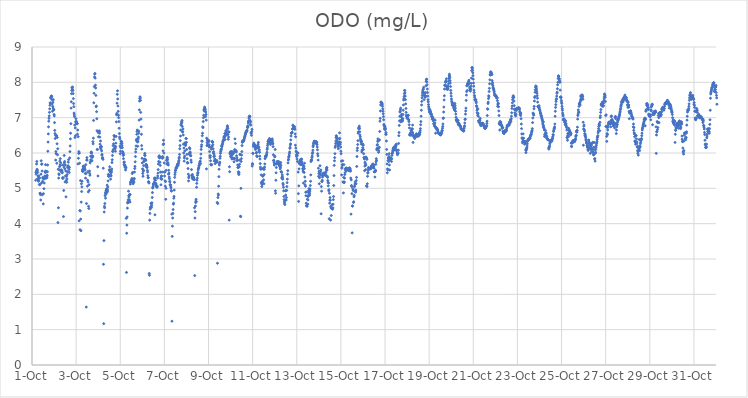
| Category | ODO (mg/L) |
|---|---|
| 44470.166666666664 | 5.23 |
| 44470.177083333336 | 5.45 |
| 44470.1875 | 5.4 |
| 44470.197916666664 | 5.49 |
| 44470.208333333336 | 5.69 |
| 44470.21875 | 5.76 |
| 44470.229166666664 | 5.54 |
| 44470.239583333336 | 5.51 |
| 44470.25 | 5.27 |
| 44470.260416666664 | 5.45 |
| 44470.270833333336 | 5.35 |
| 44470.28125 | 5.23 |
| 44470.291666666664 | 5.2 |
| 44470.302083333336 | 5.22 |
| 44470.3125 | 5.35 |
| 44470.322916666664 | 5.29 |
| 44470.333333333336 | 5.11 |
| 44470.34375 | 5.29 |
| 44470.354166666664 | 5.1 |
| 44470.364583333336 | 4.86 |
| 44470.375 | 4.86 |
| 44470.385416666664 | 4.82 |
| 44470.395833333336 | 4.67 |
| 44470.40625 | 5.4 |
| 44470.416666666664 | 5.78 |
| 44470.427083333336 | 5.15 |
| 44470.4375 | 5.68 |
| 44470.447916666664 | 5.69 |
| 44470.458333333336 | 5.49 |
| 44470.46875 | 4.82 |
| 44470.479166666664 | 5.2 |
| 44470.489583333336 | 5.31 |
| 44470.5 | 5.28 |
| 44470.510416666664 | 4.56 |
| 44470.520833333336 | 4.85 |
| 44470.53125 | 5.29 |
| 44470.541666666664 | 4.99 |
| 44470.552083333336 | 5.15 |
| 44470.5625 | 5.29 |
| 44470.572916666664 | 5.27 |
| 44470.583333333336 | 5.35 |
| 44470.59375 | 5.47 |
| 44470.604166666664 | 5.45 |
| 44470.614583333336 | 5.67 |
| 44470.625 | 5.49 |
| 44470.635416666664 | 5.46 |
| 44470.645833333336 | 5.33 |
| 44470.65625 | 5.29 |
| 44470.666666666664 | 5.34 |
| 44470.677083333336 | 5.31 |
| 44470.6875 | 5.37 |
| 44470.697916666664 | 5.47 |
| 44470.708333333336 | 5.66 |
| 44470.71875 | 6.05 |
| 44470.729166666664 | 6.31 |
| 44470.739583333336 | 6.54 |
| 44470.75 | 6.74 |
| 44470.760416666664 | 6.9 |
| 44470.770833333336 | 6.98 |
| 44470.78125 | 7.05 |
| 44470.791666666664 | 7.15 |
| 44470.802083333336 | 7.25 |
| 44470.8125 | 7.35 |
| 44470.822916666664 | 7.42 |
| 44470.833333333336 | 7.41 |
| 44470.84375 | 7.56 |
| 44470.854166666664 | 7.56 |
| 44470.864583333336 | 7.59 |
| 44470.875 | 7.61 |
| 44470.885416666664 | 7.61 |
| 44470.895833333336 | 7.59 |
| 44470.90625 | 7.51 |
| 44470.916666666664 | 7.39 |
| 44470.927083333336 | 7.18 |
| 44470.9375 | 7.32 |
| 44470.947916666664 | 7.44 |
| 44470.958333333336 | 7.27 |
| 44470.96875 | 7.51 |
| 44470.979166666664 | 7.23 |
| 44470.989583333336 | 7.22 |
| 44471.0 | 7.09 |
| 44471.010416666664 | 7.05 |
| 44471.020833333336 | 6.86 |
| 44471.03125 | 6.64 |
| 44471.041666666664 | 6.55 |
| 44471.052083333336 | 6.41 |
| 44471.0625 | 6.5 |
| 44471.072916666664 | 5.8 |
| 44471.083333333336 | 6.04 |
| 44471.09375 | 5.98 |
| 44471.104166666664 | 6.49 |
| 44471.114583333336 | 6.49 |
| 44471.125 | 5.71 |
| 44471.135416666664 | 6.26 |
| 44471.145833333336 | 6.44 |
| 44471.15625 | 5.95 |
| 44471.166666666664 | 6.12 |
| 44471.177083333336 | 4.03 |
| 44471.1875 | 5.54 |
| 44471.197916666664 | 4.45 |
| 44471.208333333336 | 5.29 |
| 44471.21875 | 5.41 |
| 44471.229166666664 | 5.39 |
| 44471.239583333336 | 5.52 |
| 44471.25 | 5.61 |
| 44471.260416666664 | 5.77 |
| 44471.270833333336 | 5.66 |
| 44471.28125 | 5.84 |
| 44471.291666666664 | 5.65 |
| 44471.302083333336 | 5.72 |
| 44471.3125 | 5.52 |
| 44471.322916666664 | 5.48 |
| 44471.333333333336 | 5.52 |
| 44471.34375 | 5.47 |
| 44471.354166666664 | 5.5 |
| 44471.364583333336 | 5.46 |
| 44471.375 | 5.44 |
| 44471.385416666664 | 5.3 |
| 44471.395833333336 | 5.28 |
| 44471.40625 | 5.66 |
| 44471.416666666664 | 5.3 |
| 44471.427083333336 | 4.2 |
| 44471.4375 | 4.94 |
| 44471.447916666664 | 5.6 |
| 44471.458333333336 | 5.93 |
| 44471.46875 | 5.72 |
| 44471.479166666664 | 5.76 |
| 44471.489583333336 | 5.55 |
| 44471.5 | 5.18 |
| 44471.510416666664 | 5.66 |
| 44471.520833333336 | 5.35 |
| 44471.53125 | 5.49 |
| 44471.541666666664 | 4.76 |
| 44471.552083333336 | 5.22 |
| 44471.5625 | 5.34 |
| 44471.572916666664 | 5.17 |
| 44471.583333333336 | 5.27 |
| 44471.59375 | 5.39 |
| 44471.604166666664 | 5.47 |
| 44471.614583333336 | 5.59 |
| 44471.625 | 5.62 |
| 44471.635416666664 | 5.64 |
| 44471.645833333336 | 5.74 |
| 44471.65625 | 5.81 |
| 44471.666666666664 | 5.6 |
| 44471.677083333336 | 5.53 |
| 44471.6875 | 5.45 |
| 44471.697916666664 | 5.59 |
| 44471.708333333336 | 5.86 |
| 44471.71875 | 6.04 |
| 44471.729166666664 | 6.2 |
| 44471.739583333336 | 6.4 |
| 44471.75 | 6.56 |
| 44471.760416666664 | 6.83 |
| 44471.770833333336 | 7.27 |
| 44471.78125 | 7.45 |
| 44471.791666666664 | 7.68 |
| 44471.802083333336 | 7.77 |
| 44471.8125 | 7.85 |
| 44471.822916666664 | 7.84 |
| 44471.833333333336 | 7.87 |
| 44471.84375 | 7.79 |
| 44471.854166666664 | 7.77 |
| 44471.864583333336 | 7.68 |
| 44471.875 | 7.54 |
| 44471.885416666664 | 7.4 |
| 44471.895833333336 | 7.31 |
| 44471.90625 | 7.13 |
| 44471.916666666664 | 7.08 |
| 44471.927083333336 | 7.03 |
| 44471.9375 | 6.79 |
| 44471.947916666664 | 6.44 |
| 44471.958333333336 | 6.71 |
| 44471.96875 | 6.49 |
| 44471.979166666664 | 6.89 |
| 44471.989583333336 | 6.97 |
| 44472.0 | 6.85 |
| 44472.010416666664 | 6.86 |
| 44472.020833333336 | 6.89 |
| 44472.03125 | 6.84 |
| 44472.041666666664 | 6.83 |
| 44472.052083333336 | 6.83 |
| 44472.0625 | 6.53 |
| 44472.072916666664 | 6.65 |
| 44472.083333333336 | 5.69 |
| 44472.09375 | 6.46 |
| 44472.104166666664 | 5.85 |
| 44472.114583333336 | 5.99 |
| 44472.125 | 6.04 |
| 44472.135416666664 | 4.08 |
| 44472.145833333336 | 6 |
| 44472.15625 | 5.71 |
| 44472.166666666664 | 4.37 |
| 44472.177083333336 | 3.83 |
| 44472.1875 | 4.36 |
| 44472.197916666664 | 5.22 |
| 44472.208333333336 | 4.13 |
| 44472.21875 | 3.8 |
| 44472.229166666664 | 4.61 |
| 44472.239583333336 | 5.13 |
| 44472.25 | 4.91 |
| 44472.260416666664 | 5.04 |
| 44472.270833333336 | 5.2 |
| 44472.28125 | 5.52 |
| 44472.291666666664 | 5.48 |
| 44472.302083333336 | 5.48 |
| 44472.3125 | 5.55 |
| 44472.322916666664 | 5.62 |
| 44472.333333333336 | 5.63 |
| 44472.34375 | 5.57 |
| 44472.354166666664 | 5.59 |
| 44472.364583333336 | 5.59 |
| 44472.375 | 5.61 |
| 44472.385416666664 | 5.56 |
| 44472.395833333336 | 5.52 |
| 44472.40625 | 5.52 |
| 44472.416666666664 | 5.42 |
| 44472.427083333336 | 5.29 |
| 44472.4375 | 5.67 |
| 44472.447916666664 | 5.42 |
| 44472.458333333336 | 1.64 |
| 44472.46875 | 4.57 |
| 44472.479166666664 | 5.8 |
| 44472.489583333336 | 5.87 |
| 44472.5 | 5.8 |
| 44472.510416666664 | 5.06 |
| 44472.520833333336 | 5.23 |
| 44472.53125 | 5.47 |
| 44472.541666666664 | 5.18 |
| 44472.552083333336 | 4.9 |
| 44472.5625 | 4.49 |
| 44472.572916666664 | 4.43 |
| 44472.583333333336 | 5.1 |
| 44472.59375 | 4.94 |
| 44472.604166666664 | 5.49 |
| 44472.614583333336 | 5.42 |
| 44472.625 | 5.37 |
| 44472.635416666664 | 5.72 |
| 44472.645833333336 | 5.76 |
| 44472.65625 | 5.91 |
| 44472.666666666664 | 5.81 |
| 44472.677083333336 | 6.01 |
| 44472.6875 | 6.03 |
| 44472.697916666664 | 6 |
| 44472.708333333336 | 5.91 |
| 44472.71875 | 5.78 |
| 44472.729166666664 | 5.87 |
| 44472.739583333336 | 5.92 |
| 44472.75 | 5.9 |
| 44472.760416666664 | 6.32 |
| 44472.770833333336 | 6.26 |
| 44472.78125 | 6.42 |
| 44472.791666666664 | 6.92 |
| 44472.802083333336 | 7.42 |
| 44472.8125 | 7.69 |
| 44472.822916666664 | 7.88 |
| 44472.833333333336 | 8.15 |
| 44472.84375 | 8.23 |
| 44472.854166666664 | 8.25 |
| 44472.864583333336 | 8.12 |
| 44472.875 | 7.92 |
| 44472.885416666664 | 7.84 |
| 44472.895833333336 | 7.63 |
| 44472.90625 | 7.31 |
| 44472.916666666664 | 7.33 |
| 44472.927083333336 | 7.17 |
| 44472.9375 | 6.97 |
| 44472.947916666664 | 6.63 |
| 44472.958333333336 | 6.1 |
| 44472.96875 | 6.1 |
| 44472.979166666664 | 5.61 |
| 44472.989583333336 | 5.35 |
| 44473.0 | 6.58 |
| 44473.010416666664 | 6.46 |
| 44473.020833333336 | 6.61 |
| 44473.03125 | 6.6 |
| 44473.041666666664 | 6.62 |
| 44473.052083333336 | 6.62 |
| 44473.0625 | 6.56 |
| 44473.072916666664 | 6.45 |
| 44473.083333333336 | 6.25 |
| 44473.09375 | 6.17 |
| 44473.104166666664 | 6.34 |
| 44473.114583333336 | 6.14 |
| 44473.125 | 6.11 |
| 44473.135416666664 | 6.19 |
| 44473.145833333336 | 6.17 |
| 44473.15625 | 6.06 |
| 44473.166666666664 | 5.94 |
| 44473.177083333336 | 5.96 |
| 44473.1875 | 5.85 |
| 44473.197916666664 | 5.87 |
| 44473.208333333336 | 5.86 |
| 44473.21875 | 5.82 |
| 44473.229166666664 | 5.57 |
| 44473.239583333336 | 2.85 |
| 44473.25 | 1.17 |
| 44473.260416666664 | 3.52 |
| 44473.270833333336 | 4.33 |
| 44473.28125 | 4.49 |
| 44473.291666666664 | 4.45 |
| 44473.302083333336 | 4.57 |
| 44473.3125 | 4.79 |
| 44473.322916666664 | 4.87 |
| 44473.333333333336 | 4.72 |
| 44473.34375 | 4.83 |
| 44473.354166666664 | 4.92 |
| 44473.364583333336 | 4.94 |
| 44473.375 | 4.97 |
| 44473.385416666664 | 4.99 |
| 44473.395833333336 | 4.88 |
| 44473.40625 | 5.09 |
| 44473.416666666664 | 4.97 |
| 44473.427083333336 | 4.92 |
| 44473.4375 | 5.04 |
| 44473.447916666664 | 5.21 |
| 44473.458333333336 | 5.39 |
| 44473.46875 | 5.34 |
| 44473.479166666664 | 5.38 |
| 44473.489583333336 | 5.34 |
| 44473.5 | 5.52 |
| 44473.510416666664 | 5.52 |
| 44473.520833333336 | 5.61 |
| 44473.53125 | 5.52 |
| 44473.541666666664 | 5.47 |
| 44473.552083333336 | 5.45 |
| 44473.5625 | 5.26 |
| 44473.572916666664 | 5.37 |
| 44473.583333333336 | 5.35 |
| 44473.59375 | 5.44 |
| 44473.604166666664 | 5.49 |
| 44473.614583333336 | 5.55 |
| 44473.625 | 5.73 |
| 44473.635416666664 | 5.81 |
| 44473.645833333336 | 5.93 |
| 44473.65625 | 6.05 |
| 44473.666666666664 | 6.04 |
| 44473.677083333336 | 6.21 |
| 44473.6875 | 6.1 |
| 44473.697916666664 | 6.26 |
| 44473.708333333336 | 6.38 |
| 44473.71875 | 6.49 |
| 44473.729166666664 | 6.49 |
| 44473.739583333336 | 6.46 |
| 44473.75 | 6.16 |
| 44473.760416666664 | 6.19 |
| 44473.770833333336 | 6.12 |
| 44473.78125 | 6.05 |
| 44473.791666666664 | 6.18 |
| 44473.802083333336 | 6.28 |
| 44473.8125 | 6.47 |
| 44473.822916666664 | 6.88 |
| 44473.833333333336 | 7.08 |
| 44473.84375 | 7.12 |
| 44473.854166666664 | 7.41 |
| 44473.864583333336 | 7.66 |
| 44473.875 | 7.76 |
| 44473.885416666664 | 7.53 |
| 44473.895833333336 | 7.33 |
| 44473.90625 | 7.18 |
| 44473.916666666664 | 7.07 |
| 44473.927083333336 | 7 |
| 44473.9375 | 6.89 |
| 44473.947916666664 | 6.7 |
| 44473.958333333336 | 6.55 |
| 44473.96875 | 6.45 |
| 44473.979166666664 | 6.4 |
| 44473.989583333336 | 6.2 |
| 44474.0 | 5.98 |
| 44474.010416666664 | 6.05 |
| 44474.020833333336 | 6.15 |
| 44474.03125 | 6.27 |
| 44474.041666666664 | 6.33 |
| 44474.052083333336 | 6.32 |
| 44474.0625 | 6.32 |
| 44474.072916666664 | 6.27 |
| 44474.083333333336 | 6.21 |
| 44474.09375 | 6.15 |
| 44474.104166666664 | 6.04 |
| 44474.114583333336 | 5.99 |
| 44474.125 | 6.02 |
| 44474.135416666664 | 5.93 |
| 44474.145833333336 | 5.84 |
| 44474.15625 | 5.96 |
| 44474.166666666664 | 5.74 |
| 44474.177083333336 | 5.68 |
| 44474.1875 | 5.74 |
| 44474.197916666664 | 5.65 |
| 44474.208333333336 | 5.61 |
| 44474.21875 | 5.65 |
| 44474.229166666664 | 5.59 |
| 44474.239583333336 | 5.52 |
| 44474.25 | 5.6 |
| 44474.260416666664 | 5.58 |
| 44474.270833333336 | 4.15 |
| 44474.28125 | 2.62 |
| 44474.291666666664 | 3.73 |
| 44474.302083333336 | 3.96 |
| 44474.3125 | 4.19 |
| 44474.322916666664 | 4.44 |
| 44474.333333333336 | 4.59 |
| 44474.34375 | 4.59 |
| 44474.354166666664 | 4.63 |
| 44474.364583333336 | 4.68 |
| 44474.375 | 4.92 |
| 44474.385416666664 | 4.79 |
| 44474.395833333336 | 4.75 |
| 44474.40625 | 4.63 |
| 44474.416666666664 | 4.67 |
| 44474.427083333336 | 4.83 |
| 44474.4375 | 4.61 |
| 44474.447916666664 | 4.82 |
| 44474.458333333336 | 5.12 |
| 44474.46875 | 5.17 |
| 44474.479166666664 | 5.18 |
| 44474.489583333336 | 5.19 |
| 44474.5 | 5.2 |
| 44474.510416666664 | 5.24 |
| 44474.520833333336 | 5.24 |
| 44474.53125 | 5.28 |
| 44474.541666666664 | 5.42 |
| 44474.552083333336 | 5.19 |
| 44474.5625 | 5.45 |
| 44474.572916666664 | 5.22 |
| 44474.583333333336 | 5.13 |
| 44474.59375 | 5.2 |
| 44474.604166666664 | 5.19 |
| 44474.614583333336 | 5.17 |
| 44474.625 | 5.26 |
| 44474.635416666664 | 5.28 |
| 44474.645833333336 | 5.46 |
| 44474.65625 | 5.56 |
| 44474.666666666664 | 5.62 |
| 44474.677083333336 | 5.75 |
| 44474.6875 | 5.9 |
| 44474.697916666664 | 6.03 |
| 44474.708333333336 | 6.11 |
| 44474.71875 | 6.2 |
| 44474.729166666664 | 6.35 |
| 44474.739583333336 | 6.39 |
| 44474.75 | 6.53 |
| 44474.760416666664 | 6.61 |
| 44474.770833333336 | 6.65 |
| 44474.78125 | 6.31 |
| 44474.791666666664 | 6.19 |
| 44474.802083333336 | 6.33 |
| 44474.8125 | 6.4 |
| 44474.822916666664 | 6.45 |
| 44474.833333333336 | 6.56 |
| 44474.84375 | 6.62 |
| 44474.854166666664 | 6.93 |
| 44474.864583333336 | 7.22 |
| 44474.875 | 7.47 |
| 44474.885416666664 | 7.54 |
| 44474.895833333336 | 7.59 |
| 44474.90625 | 7.56 |
| 44474.916666666664 | 7.49 |
| 44474.927083333336 | 7.15 |
| 44474.9375 | 6.96 |
| 44474.947916666664 | 6.74 |
| 44474.958333333336 | 6.53 |
| 44474.96875 | 6.21 |
| 44474.979166666664 | 6.11 |
| 44474.989583333336 | 5.85 |
| 44475.0 | 5.72 |
| 44475.010416666664 | 5.55 |
| 44475.020833333336 | 5.42 |
| 44475.03125 | 5.34 |
| 44475.041666666664 | 5.48 |
| 44475.052083333336 | 5.51 |
| 44475.0625 | 5.64 |
| 44475.072916666664 | 5.76 |
| 44475.083333333336 | 5.78 |
| 44475.09375 | 5.83 |
| 44475.104166666664 | 5.94 |
| 44475.114583333336 | 5.99 |
| 44475.125 | 5.93 |
| 44475.135416666664 | 5.82 |
| 44475.145833333336 | 5.81 |
| 44475.15625 | 5.79 |
| 44475.166666666664 | 5.68 |
| 44475.177083333336 | 5.64 |
| 44475.1875 | 5.6 |
| 44475.197916666664 | 5.66 |
| 44475.208333333336 | 5.63 |
| 44475.21875 | 5.59 |
| 44475.229166666664 | 5.51 |
| 44475.239583333336 | 5.46 |
| 44475.25 | 5.36 |
| 44475.260416666664 | 5.3 |
| 44475.270833333336 | 5.3 |
| 44475.28125 | 5.19 |
| 44475.291666666664 | 5.17 |
| 44475.302083333336 | 5.15 |
| 44475.3125 | 2.59 |
| 44475.322916666664 | 2.54 |
| 44475.333333333336 | 4.1 |
| 44475.34375 | 4.29 |
| 44475.354166666664 | 4.41 |
| 44475.364583333336 | 4.45 |
| 44475.375 | 4.46 |
| 44475.385416666664 | 4.48 |
| 44475.395833333336 | 4.58 |
| 44475.40625 | 4.57 |
| 44475.416666666664 | 4.46 |
| 44475.427083333336 | 4.52 |
| 44475.4375 | 4.59 |
| 44475.447916666664 | 4.74 |
| 44475.458333333336 | 4.88 |
| 44475.46875 | 5.01 |
| 44475.479166666664 | 5.02 |
| 44475.489583333336 | 5.06 |
| 44475.5 | 5.12 |
| 44475.510416666664 | 5.11 |
| 44475.520833333336 | 5.13 |
| 44475.53125 | 5.13 |
| 44475.541666666664 | 5.17 |
| 44475.552083333336 | 5.29 |
| 44475.5625 | 5.24 |
| 44475.572916666664 | 4.25 |
| 44475.583333333336 | 5.29 |
| 44475.59375 | 5.23 |
| 44475.604166666664 | 5.12 |
| 44475.614583333336 | 5.14 |
| 44475.625 | 5.09 |
| 44475.635416666664 | 5.06 |
| 44475.645833333336 | 5.07 |
| 44475.65625 | 5.04 |
| 44475.666666666664 | 5.03 |
| 44475.677083333336 | 5.06 |
| 44475.6875 | 5.29 |
| 44475.697916666664 | 5.35 |
| 44475.708333333336 | 5.43 |
| 44475.71875 | 5.53 |
| 44475.729166666664 | 5.69 |
| 44475.739583333336 | 5.76 |
| 44475.75 | 5.9 |
| 44475.760416666664 | 5.88 |
| 44475.770833333336 | 5.92 |
| 44475.78125 | 5.86 |
| 44475.791666666664 | 5.88 |
| 44475.802083333336 | 5.74 |
| 44475.8125 | 5.65 |
| 44475.822916666664 | 5.46 |
| 44475.833333333336 | 5.29 |
| 44475.84375 | 5.1 |
| 44475.854166666664 | 5.26 |
| 44475.864583333336 | 5.35 |
| 44475.875 | 5.34 |
| 44475.885416666664 | 5.26 |
| 44475.895833333336 | 5.46 |
| 44475.90625 | 5.85 |
| 44475.916666666664 | 5.9 |
| 44475.927083333336 | 5.87 |
| 44475.9375 | 6.06 |
| 44475.947916666664 | 6.24 |
| 44475.958333333336 | 6.36 |
| 44475.96875 | 6.26 |
| 44475.979166666664 | 6 |
| 44475.989583333336 | 5.72 |
| 44476.0 | 5.46 |
| 44476.010416666664 | 5.35 |
| 44476.020833333336 | 5.46 |
| 44476.03125 | 5.21 |
| 44476.041666666664 | 5.06 |
| 44476.052083333336 | 5.19 |
| 44476.0625 | 4.69 |
| 44476.072916666664 | 5 |
| 44476.083333333336 | 5.51 |
| 44476.09375 | 5.79 |
| 44476.104166666664 | 5.69 |
| 44476.114583333336 | 5.83 |
| 44476.125 | 5.88 |
| 44476.135416666664 | 5.86 |
| 44476.145833333336 | 5.81 |
| 44476.15625 | 5.73 |
| 44476.166666666664 | 5.69 |
| 44476.177083333336 | 5.66 |
| 44476.1875 | 5.4 |
| 44476.197916666664 | 5.51 |
| 44476.208333333336 | 5.43 |
| 44476.21875 | 5.32 |
| 44476.229166666664 | 5.27 |
| 44476.239583333336 | 5.2 |
| 44476.25 | 5.18 |
| 44476.260416666664 | 5.1 |
| 44476.270833333336 | 5.1 |
| 44476.28125 | 5.09 |
| 44476.291666666664 | 5.04 |
| 44476.302083333336 | 5.01 |
| 44476.3125 | 4.94 |
| 44476.322916666664 | 4.92 |
| 44476.333333333336 | 4.27 |
| 44476.34375 | 1.24 |
| 44476.354166666664 | 3.64 |
| 44476.364583333336 | 3.93 |
| 44476.375 | 4.16 |
| 44476.385416666664 | 4.29 |
| 44476.395833333336 | 4.4 |
| 44476.40625 | 4.55 |
| 44476.416666666664 | 4.58 |
| 44476.427083333336 | 4.72 |
| 44476.4375 | 4.77 |
| 44476.447916666664 | 4.95 |
| 44476.458333333336 | 5.17 |
| 44476.46875 | 5.31 |
| 44476.479166666664 | 5.39 |
| 44476.489583333336 | 5.45 |
| 44476.5 | 5.51 |
| 44476.510416666664 | 5.51 |
| 44476.520833333336 | 5.57 |
| 44476.53125 | 5.58 |
| 44476.541666666664 | 5.57 |
| 44476.552083333336 | 5.59 |
| 44476.5625 | 5.6 |
| 44476.572916666664 | 5.64 |
| 44476.583333333336 | 5.66 |
| 44476.59375 | 5.68 |
| 44476.604166666664 | 5.68 |
| 44476.614583333336 | 5.68 |
| 44476.625 | 5.65 |
| 44476.635416666664 | 5.71 |
| 44476.645833333336 | 5.75 |
| 44476.65625 | 5.79 |
| 44476.666666666664 | 5.85 |
| 44476.677083333336 | 5.88 |
| 44476.6875 | 5.96 |
| 44476.697916666664 | 6.12 |
| 44476.708333333336 | 6.21 |
| 44476.71875 | 6.35 |
| 44476.729166666664 | 6.48 |
| 44476.739583333336 | 6.65 |
| 44476.75 | 6.8 |
| 44476.760416666664 | 6.79 |
| 44476.770833333336 | 6.84 |
| 44476.78125 | 6.89 |
| 44476.791666666664 | 6.87 |
| 44476.802083333336 | 6.92 |
| 44476.8125 | 6.75 |
| 44476.822916666664 | 6.6 |
| 44476.833333333336 | 6.6 |
| 44476.84375 | 6.68 |
| 44476.854166666664 | 6.51 |
| 44476.864583333336 | 6.25 |
| 44476.875 | 6 |
| 44476.885416666664 | 6.14 |
| 44476.895833333336 | 5.77 |
| 44476.90625 | 5.86 |
| 44476.916666666664 | 5.91 |
| 44476.927083333336 | 6.06 |
| 44476.9375 | 6.29 |
| 44476.947916666664 | 6.25 |
| 44476.958333333336 | 6.21 |
| 44476.96875 | 6.25 |
| 44476.979166666664 | 6.41 |
| 44476.989583333336 | 6.41 |
| 44477.0 | 6.3 |
| 44477.010416666664 | 6.1 |
| 44477.020833333336 | 5.96 |
| 44477.03125 | 5.84 |
| 44477.041666666664 | 5.73 |
| 44477.052083333336 | 5.72 |
| 44477.0625 | 5.72 |
| 44477.072916666664 | 5.56 |
| 44477.083333333336 | 5.4 |
| 44477.09375 | 5.21 |
| 44477.104166666664 | 5.3 |
| 44477.114583333336 | 5.34 |
| 44477.125 | 5.99 |
| 44477.135416666664 | 6.15 |
| 44477.145833333336 | 5.95 |
| 44477.15625 | 6.12 |
| 44477.166666666664 | 6.03 |
| 44477.177083333336 | 6 |
| 44477.1875 | 5.93 |
| 44477.197916666664 | 5.92 |
| 44477.208333333336 | 5.8 |
| 44477.21875 | 5.74 |
| 44477.229166666664 | 5.53 |
| 44477.239583333336 | 5.37 |
| 44477.25 | 5.37 |
| 44477.260416666664 | 5.29 |
| 44477.270833333336 | 5.39 |
| 44477.28125 | 5.33 |
| 44477.291666666664 | 5.26 |
| 44477.302083333336 | 5.31 |
| 44477.3125 | 5.31 |
| 44477.322916666664 | 5.31 |
| 44477.333333333336 | 5.26 |
| 44477.34375 | 5.26 |
| 44477.354166666664 | 5.25 |
| 44477.364583333336 | 4.45 |
| 44477.375 | 2.53 |
| 44477.385416666664 | 4.16 |
| 44477.395833333336 | 4.34 |
| 44477.40625 | 4.5 |
| 44477.416666666664 | 4.6 |
| 44477.427083333336 | 4.64 |
| 44477.4375 | 4.69 |
| 44477.447916666664 | 4.62 |
| 44477.458333333336 | 5.03 |
| 44477.46875 | 5.14 |
| 44477.479166666664 | 5.23 |
| 44477.489583333336 | 5.29 |
| 44477.5 | 5.37 |
| 44477.510416666664 | 5.42 |
| 44477.520833333336 | 5.45 |
| 44477.53125 | 5.52 |
| 44477.541666666664 | 5.56 |
| 44477.552083333336 | 5.57 |
| 44477.5625 | 5.6 |
| 44477.572916666664 | 5.64 |
| 44477.583333333336 | 5.65 |
| 44477.59375 | 5.69 |
| 44477.604166666664 | 5.72 |
| 44477.614583333336 | 5.75 |
| 44477.625 | 5.77 |
| 44477.635416666664 | 5.7 |
| 44477.645833333336 | 5.85 |
| 44477.65625 | 5.97 |
| 44477.666666666664 | 6.1 |
| 44477.677083333336 | 6.18 |
| 44477.6875 | 6.23 |
| 44477.697916666664 | 6.34 |
| 44477.708333333336 | 6.33 |
| 44477.71875 | 6.49 |
| 44477.729166666664 | 6.56 |
| 44477.739583333336 | 6.74 |
| 44477.75 | 6.72 |
| 44477.760416666664 | 6.89 |
| 44477.770833333336 | 7 |
| 44477.78125 | 7.07 |
| 44477.791666666664 | 7.22 |
| 44477.802083333336 | 7.19 |
| 44477.8125 | 7.25 |
| 44477.822916666664 | 7.3 |
| 44477.833333333336 | 7.27 |
| 44477.84375 | 7.21 |
| 44477.854166666664 | 7.24 |
| 44477.864583333336 | 7.03 |
| 44477.875 | 7.16 |
| 44477.885416666664 | 7.09 |
| 44477.895833333336 | 6.93 |
| 44477.90625 | 5.55 |
| 44477.916666666664 | 6.42 |
| 44477.927083333336 | 6.21 |
| 44477.9375 | 6.29 |
| 44477.947916666664 | 6.35 |
| 44477.958333333336 | 6.38 |
| 44477.96875 | 6.36 |
| 44477.979166666664 | 6.24 |
| 44477.989583333336 | 6.21 |
| 44478.0 | 6.2 |
| 44478.010416666664 | 6.32 |
| 44478.020833333336 | 6.35 |
| 44478.03125 | 6.23 |
| 44478.041666666664 | 6.17 |
| 44478.052083333336 | 6.04 |
| 44478.0625 | 5.92 |
| 44478.072916666664 | 5.87 |
| 44478.083333333336 | 5.92 |
| 44478.09375 | 5.78 |
| 44478.104166666664 | 5.68 |
| 44478.114583333336 | 5.66 |
| 44478.125 | 6.11 |
| 44478.135416666664 | 6.17 |
| 44478.145833333336 | 5.67 |
| 44478.15625 | 6.19 |
| 44478.166666666664 | 6.33 |
| 44478.177083333336 | 6.31 |
| 44478.1875 | 6.3 |
| 44478.197916666664 | 6.23 |
| 44478.208333333336 | 6.12 |
| 44478.21875 | 6 |
| 44478.229166666664 | 6.04 |
| 44478.239583333336 | 5.9 |
| 44478.25 | 5.97 |
| 44478.260416666664 | 5.77 |
| 44478.270833333336 | 5.91 |
| 44478.28125 | 5.83 |
| 44478.291666666664 | 5.78 |
| 44478.302083333336 | 5.7 |
| 44478.3125 | 5.81 |
| 44478.322916666664 | 5.78 |
| 44478.333333333336 | 5.78 |
| 44478.34375 | 5.76 |
| 44478.354166666664 | 5.76 |
| 44478.364583333336 | 5.75 |
| 44478.375 | 5.79 |
| 44478.385416666664 | 5.74 |
| 44478.395833333336 | 4.6 |
| 44478.40625 | 2.88 |
| 44478.416666666664 | 4.57 |
| 44478.427083333336 | 4.74 |
| 44478.4375 | 4.84 |
| 44478.447916666664 | 4.81 |
| 44478.458333333336 | 5.06 |
| 44478.46875 | 5.33 |
| 44478.479166666664 | 5.54 |
| 44478.489583333336 | 5.66 |
| 44478.5 | 5.71 |
| 44478.510416666664 | 5.74 |
| 44478.520833333336 | 5.85 |
| 44478.53125 | 5.91 |
| 44478.541666666664 | 5.99 |
| 44478.552083333336 | 6.04 |
| 44478.5625 | 6.07 |
| 44478.572916666664 | 6.1 |
| 44478.583333333336 | 6.12 |
| 44478.59375 | 6.2 |
| 44478.604166666664 | 6.18 |
| 44478.614583333336 | 6.2 |
| 44478.625 | 6.24 |
| 44478.635416666664 | 6.26 |
| 44478.645833333336 | 6.31 |
| 44478.65625 | 6.32 |
| 44478.666666666664 | 6.36 |
| 44478.677083333336 | 6.36 |
| 44478.6875 | 6.39 |
| 44478.697916666664 | 6.44 |
| 44478.708333333336 | 6.47 |
| 44478.71875 | 6.46 |
| 44478.729166666664 | 6.46 |
| 44478.739583333336 | 6.55 |
| 44478.75 | 6.38 |
| 44478.760416666664 | 6.54 |
| 44478.770833333336 | 6.54 |
| 44478.78125 | 6.63 |
| 44478.791666666664 | 6.5 |
| 44478.802083333336 | 6.6 |
| 44478.8125 | 6.57 |
| 44478.822916666664 | 6.64 |
| 44478.833333333336 | 6.54 |
| 44478.84375 | 6.7 |
| 44478.854166666664 | 6.77 |
| 44478.864583333336 | 6.74 |
| 44478.875 | 6.69 |
| 44478.885416666664 | 6.52 |
| 44478.895833333336 | 6.39 |
| 44478.90625 | 6.45 |
| 44478.916666666664 | 6.59 |
| 44478.927083333336 | 6.6 |
| 44478.9375 | 4.1 |
| 44478.947916666664 | 5.61 |
| 44478.958333333336 | 5.47 |
| 44478.96875 | 6 |
| 44478.979166666664 | 5.97 |
| 44478.989583333336 | 6.03 |
| 44479.0 | 5.9 |
| 44479.010416666664 | 6.03 |
| 44479.020833333336 | 5.95 |
| 44479.03125 | 5.89 |
| 44479.041666666664 | 6.04 |
| 44479.052083333336 | 5.86 |
| 44479.0625 | 5.83 |
| 44479.072916666664 | 5.95 |
| 44479.083333333336 | 5.96 |
| 44479.09375 | 5.99 |
| 44479.104166666664 | 5.86 |
| 44479.114583333336 | 6.04 |
| 44479.125 | 6 |
| 44479.135416666664 | 5.99 |
| 44479.145833333336 | 5.84 |
| 44479.15625 | 5.75 |
| 44479.166666666664 | 5.83 |
| 44479.177083333336 | 5.85 |
| 44479.1875 | 6.1 |
| 44479.197916666664 | 6.4 |
| 44479.208333333336 | 6.05 |
| 44479.21875 | 6.27 |
| 44479.229166666664 | 6.06 |
| 44479.239583333336 | 6.07 |
| 44479.25 | 6.05 |
| 44479.260416666664 | 6.03 |
| 44479.270833333336 | 5.92 |
| 44479.28125 | 5.79 |
| 44479.291666666664 | 5.86 |
| 44479.302083333336 | 5.8 |
| 44479.3125 | 5.79 |
| 44479.322916666664 | 5.66 |
| 44479.333333333336 | 5.59 |
| 44479.34375 | 5.59 |
| 44479.354166666664 | 5.47 |
| 44479.364583333336 | 5.42 |
| 44479.375 | 5.39 |
| 44479.385416666664 | 5.45 |
| 44479.395833333336 | 5.61 |
| 44479.40625 | 5.68 |
| 44479.416666666664 | 5.8 |
| 44479.427083333336 | 5.96 |
| 44479.4375 | 5.96 |
| 44479.447916666664 | 4.21 |
| 44479.458333333336 | 4.2 |
| 44479.46875 | 5 |
| 44479.479166666664 | 5.76 |
| 44479.489583333336 | 5.84 |
| 44479.5 | 5.94 |
| 44479.510416666664 | 6.04 |
| 44479.520833333336 | 6.21 |
| 44479.53125 | 6.3 |
| 44479.541666666664 | 6.34 |
| 44479.552083333336 | 6.34 |
| 44479.5625 | 6.32 |
| 44479.572916666664 | 6.34 |
| 44479.583333333336 | 6.33 |
| 44479.59375 | 6.34 |
| 44479.604166666664 | 6.36 |
| 44479.614583333336 | 6.39 |
| 44479.625 | 6.42 |
| 44479.635416666664 | 6.45 |
| 44479.645833333336 | 6.47 |
| 44479.65625 | 6.49 |
| 44479.666666666664 | 6.53 |
| 44479.677083333336 | 6.54 |
| 44479.6875 | 6.58 |
| 44479.697916666664 | 6.58 |
| 44479.708333333336 | 6.6 |
| 44479.71875 | 6.62 |
| 44479.729166666664 | 6.63 |
| 44479.739583333336 | 6.62 |
| 44479.75 | 6.65 |
| 44479.760416666664 | 6.73 |
| 44479.770833333336 | 6.72 |
| 44479.78125 | 6.77 |
| 44479.791666666664 | 6.74 |
| 44479.802083333336 | 6.85 |
| 44479.8125 | 6.89 |
| 44479.822916666664 | 6.91 |
| 44479.833333333336 | 6.98 |
| 44479.84375 | 7.03 |
| 44479.854166666664 | 7.04 |
| 44479.864583333336 | 7.02 |
| 44479.875 | 7.04 |
| 44479.885416666664 | 6.92 |
| 44479.895833333336 | 6.81 |
| 44479.90625 | 6.88 |
| 44479.916666666664 | 6.79 |
| 44479.927083333336 | 6.57 |
| 44479.9375 | 6.56 |
| 44479.947916666664 | 6.5 |
| 44479.958333333336 | 6.61 |
| 44479.96875 | 6.67 |
| 44479.979166666664 | 5.63 |
| 44479.989583333336 | 5.7 |
| 44480.0 | 5.68 |
| 44480.010416666664 | 5.99 |
| 44480.020833333336 | 5.99 |
| 44480.03125 | 6.19 |
| 44480.041666666664 | 6.23 |
| 44480.052083333336 | 6.28 |
| 44480.0625 | 6.25 |
| 44480.072916666664 | 6.21 |
| 44480.083333333336 | 6.2 |
| 44480.09375 | 6.2 |
| 44480.104166666664 | 6.23 |
| 44480.114583333336 | 6.14 |
| 44480.125 | 6.1 |
| 44480.135416666664 | 6.2 |
| 44480.145833333336 | 6.15 |
| 44480.15625 | 6.14 |
| 44480.166666666664 | 6 |
| 44480.177083333336 | 6.02 |
| 44480.1875 | 5.92 |
| 44480.197916666664 | 5.91 |
| 44480.208333333336 | 5.9 |
| 44480.21875 | 6.15 |
| 44480.229166666664 | 6.2 |
| 44480.239583333336 | 6.14 |
| 44480.25 | 6.25 |
| 44480.260416666664 | 6.3 |
| 44480.270833333336 | 6.18 |
| 44480.28125 | 6.16 |
| 44480.291666666664 | 6.06 |
| 44480.302083333336 | 6.09 |
| 44480.3125 | 6.02 |
| 44480.322916666664 | 5.91 |
| 44480.333333333336 | 5.83 |
| 44480.34375 | 5.7 |
| 44480.354166666664 | 5.6 |
| 44480.364583333336 | 5.55 |
| 44480.375 | 5.54 |
| 44480.385416666664 | 5.38 |
| 44480.395833333336 | 5.17 |
| 44480.40625 | 5.14 |
| 44480.416666666664 | 5.05 |
| 44480.427083333336 | 5.11 |
| 44480.4375 | 5.16 |
| 44480.447916666664 | 5.2 |
| 44480.458333333336 | 5.34 |
| 44480.46875 | 5.36 |
| 44480.479166666664 | 5.57 |
| 44480.489583333336 | 5.54 |
| 44480.5 | 5.24 |
| 44480.510416666664 | 5.13 |
| 44480.520833333336 | 5.39 |
| 44480.53125 | 5.54 |
| 44480.541666666664 | 5.6 |
| 44480.552083333336 | 5.69 |
| 44480.5625 | 5.84 |
| 44480.572916666664 | 5.91 |
| 44480.583333333336 | 5.89 |
| 44480.59375 | 5.9 |
| 44480.604166666664 | 5.89 |
| 44480.614583333336 | 5.92 |
| 44480.625 | 5.94 |
| 44480.635416666664 | 5.97 |
| 44480.645833333336 | 6.02 |
| 44480.65625 | 6.1 |
| 44480.666666666664 | 6.14 |
| 44480.677083333336 | 6.21 |
| 44480.6875 | 6.26 |
| 44480.697916666664 | 6.32 |
| 44480.708333333336 | 6.32 |
| 44480.71875 | 6.35 |
| 44480.729166666664 | 6.36 |
| 44480.739583333336 | 6.37 |
| 44480.75 | 6.38 |
| 44480.760416666664 | 6.41 |
| 44480.770833333336 | 6.38 |
| 44480.78125 | 6.38 |
| 44480.791666666664 | 6.32 |
| 44480.802083333336 | 6.27 |
| 44480.8125 | 6.24 |
| 44480.822916666664 | 6.29 |
| 44480.833333333336 | 6.37 |
| 44480.84375 | 6.36 |
| 44480.854166666664 | 6.35 |
| 44480.864583333336 | 6.36 |
| 44480.875 | 6.38 |
| 44480.885416666664 | 6.4 |
| 44480.895833333336 | 6.34 |
| 44480.90625 | 6.28 |
| 44480.916666666664 | 6.26 |
| 44480.927083333336 | 6.18 |
| 44480.9375 | 5.95 |
| 44480.947916666664 | 5.79 |
| 44480.958333333336 | 5.79 |
| 44480.96875 | 5.74 |
| 44480.979166666664 | 5.66 |
| 44480.989583333336 | 5.69 |
| 44481.0 | 5.89 |
| 44481.010416666664 | 5.91 |
| 44481.020833333336 | 6.1 |
| 44481.03125 | 4.93 |
| 44481.041666666664 | 4.86 |
| 44481.052083333336 | 5.23 |
| 44481.0625 | 5.44 |
| 44481.072916666664 | 5.59 |
| 44481.083333333336 | 5.69 |
| 44481.09375 | 5.7 |
| 44481.104166666664 | 5.74 |
| 44481.114583333336 | 5.76 |
| 44481.125 | 5.72 |
| 44481.135416666664 | 5.7 |
| 44481.145833333336 | 5.73 |
| 44481.15625 | 5.72 |
| 44481.166666666664 | 5.71 |
| 44481.177083333336 | 5.76 |
| 44481.1875 | 5.7 |
| 44481.197916666664 | 5.69 |
| 44481.208333333336 | 5.65 |
| 44481.21875 | 5.66 |
| 44481.229166666664 | 5.62 |
| 44481.239583333336 | 5.7 |
| 44481.25 | 5.55 |
| 44481.260416666664 | 5.59 |
| 44481.270833333336 | 5.73 |
| 44481.28125 | 5.65 |
| 44481.291666666664 | 5.47 |
| 44481.302083333336 | 5.46 |
| 44481.3125 | 5.46 |
| 44481.322916666664 | 5.31 |
| 44481.333333333336 | 5.28 |
| 44481.34375 | 5.38 |
| 44481.354166666664 | 5.32 |
| 44481.364583333336 | 5.26 |
| 44481.375 | 5.14 |
| 44481.385416666664 | 5.1 |
| 44481.395833333336 | 5.03 |
| 44481.40625 | 4.93 |
| 44481.416666666664 | 4.77 |
| 44481.427083333336 | 4.68 |
| 44481.4375 | 4.62 |
| 44481.447916666664 | 4.58 |
| 44481.458333333336 | 4.54 |
| 44481.46875 | 4.67 |
| 44481.479166666664 | 4.67 |
| 44481.489583333336 | 4.93 |
| 44481.5 | 4.81 |
| 44481.510416666664 | 4.94 |
| 44481.520833333336 | 4.67 |
| 44481.53125 | 4.74 |
| 44481.541666666664 | 4.94 |
| 44481.552083333336 | 5.05 |
| 44481.5625 | 5.16 |
| 44481.572916666664 | 5.26 |
| 44481.583333333336 | 5.4 |
| 44481.59375 | 5.5 |
| 44481.604166666664 | 5.72 |
| 44481.614583333336 | 5.8 |
| 44481.625 | 5.82 |
| 44481.635416666664 | 5.88 |
| 44481.645833333336 | 5.9 |
| 44481.65625 | 5.94 |
| 44481.666666666664 | 5.99 |
| 44481.677083333336 | 6.03 |
| 44481.6875 | 6.13 |
| 44481.697916666664 | 6.16 |
| 44481.708333333336 | 6.23 |
| 44481.71875 | 6.26 |
| 44481.729166666664 | 6.37 |
| 44481.739583333336 | 6.48 |
| 44481.75 | 6.56 |
| 44481.760416666664 | 6.56 |
| 44481.770833333336 | 6.57 |
| 44481.78125 | 6.57 |
| 44481.791666666664 | 6.59 |
| 44481.802083333336 | 6.68 |
| 44481.8125 | 6.68 |
| 44481.822916666664 | 6.79 |
| 44481.833333333336 | 6.77 |
| 44481.84375 | 6.7 |
| 44481.854166666664 | 6.73 |
| 44481.864583333336 | 6.74 |
| 44481.875 | 6.75 |
| 44481.885416666664 | 6.69 |
| 44481.895833333336 | 6.68 |
| 44481.90625 | 6.74 |
| 44481.916666666664 | 6.67 |
| 44481.927083333336 | 6.54 |
| 44481.9375 | 6.22 |
| 44481.947916666664 | 6.46 |
| 44481.958333333336 | 6.14 |
| 44481.96875 | 6.05 |
| 44481.979166666664 | 5.95 |
| 44481.989583333336 | 5.9 |
| 44482.0 | 6.02 |
| 44482.010416666664 | 5.83 |
| 44482.020833333336 | 5.92 |
| 44482.03125 | 5.76 |
| 44482.041666666664 | 5.99 |
| 44482.052083333336 | 6 |
| 44482.0625 | 5.46 |
| 44482.072916666664 | 4.85 |
| 44482.083333333336 | 4.63 |
| 44482.09375 | 5.07 |
| 44482.104166666664 | 5.55 |
| 44482.114583333336 | 5.7 |
| 44482.125 | 5.72 |
| 44482.135416666664 | 5.71 |
| 44482.145833333336 | 5.79 |
| 44482.15625 | 5.75 |
| 44482.166666666664 | 5.67 |
| 44482.177083333336 | 5.82 |
| 44482.1875 | 5.8 |
| 44482.197916666664 | 5.81 |
| 44482.208333333336 | 5.81 |
| 44482.21875 | 5.83 |
| 44482.229166666664 | 5.75 |
| 44482.239583333336 | 5.72 |
| 44482.25 | 5.66 |
| 44482.260416666664 | 5.66 |
| 44482.270833333336 | 5.56 |
| 44482.28125 | 5.52 |
| 44482.291666666664 | 5.47 |
| 44482.302083333336 | 5.15 |
| 44482.3125 | 5.61 |
| 44482.322916666664 | 5.63 |
| 44482.333333333336 | 5.45 |
| 44482.34375 | 5.56 |
| 44482.354166666664 | 5.71 |
| 44482.364583333336 | 5.32 |
| 44482.375 | 5.1 |
| 44482.385416666664 | 5.2 |
| 44482.395833333336 | 5.06 |
| 44482.40625 | 4.89 |
| 44482.416666666664 | 4.79 |
| 44482.427083333336 | 4.58 |
| 44482.4375 | 4.51 |
| 44482.447916666664 | 4.51 |
| 44482.458333333336 | 4.9 |
| 44482.46875 | 4.49 |
| 44482.479166666664 | 4.69 |
| 44482.489583333336 | 4.78 |
| 44482.5 | 4.55 |
| 44482.510416666664 | 4.67 |
| 44482.520833333336 | 4.77 |
| 44482.53125 | 4.88 |
| 44482.541666666664 | 4.94 |
| 44482.552083333336 | 4.99 |
| 44482.5625 | 4.82 |
| 44482.572916666664 | 4.8 |
| 44482.583333333336 | 4.86 |
| 44482.59375 | 4.92 |
| 44482.604166666664 | 4.98 |
| 44482.614583333336 | 5.08 |
| 44482.625 | 5.2 |
| 44482.635416666664 | 5.38 |
| 44482.645833333336 | 5.76 |
| 44482.65625 | 5.79 |
| 44482.666666666664 | 5.81 |
| 44482.677083333336 | 5.8 |
| 44482.6875 | 5.87 |
| 44482.697916666664 | 5.91 |
| 44482.708333333336 | 5.98 |
| 44482.71875 | 6.02 |
| 44482.729166666664 | 6.08 |
| 44482.739583333336 | 6.18 |
| 44482.75 | 6.22 |
| 44482.760416666664 | 6.27 |
| 44482.770833333336 | 6.28 |
| 44482.78125 | 6.3 |
| 44482.791666666664 | 6.33 |
| 44482.802083333336 | 6.33 |
| 44482.8125 | 6.31 |
| 44482.822916666664 | 6.29 |
| 44482.833333333336 | 6.29 |
| 44482.84375 | 6.28 |
| 44482.854166666664 | 6.31 |
| 44482.864583333336 | 6.32 |
| 44482.875 | 6.29 |
| 44482.885416666664 | 6.32 |
| 44482.895833333336 | 6.31 |
| 44482.90625 | 6.29 |
| 44482.916666666664 | 6.24 |
| 44482.927083333336 | 6.17 |
| 44482.9375 | 6.09 |
| 44482.947916666664 | 5.98 |
| 44482.958333333336 | 5.92 |
| 44482.96875 | 5.8 |
| 44482.979166666664 | 5.57 |
| 44482.989583333336 | 5.34 |
| 44483.0 | 5.42 |
| 44483.010416666664 | 5.48 |
| 44483.020833333336 | 5.13 |
| 44483.03125 | 5.3 |
| 44483.041666666664 | 5.42 |
| 44483.052083333336 | 5.64 |
| 44483.0625 | 5.43 |
| 44483.072916666664 | 5.47 |
| 44483.083333333336 | 5.37 |
| 44483.09375 | 5.52 |
| 44483.104166666664 | 4.28 |
| 44483.114583333336 | 5.05 |
| 44483.125 | 4.92 |
| 44483.135416666664 | 5.19 |
| 44483.145833333336 | 5.2 |
| 44483.15625 | 5.23 |
| 44483.166666666664 | 5.32 |
| 44483.177083333336 | 5.38 |
| 44483.1875 | 5.41 |
| 44483.197916666664 | 5.37 |
| 44483.208333333336 | 5.43 |
| 44483.21875 | 5.42 |
| 44483.229166666664 | 5.42 |
| 44483.239583333336 | 5.43 |
| 44483.25 | 5.43 |
| 44483.260416666664 | 5.41 |
| 44483.270833333336 | 5.38 |
| 44483.28125 | 5.39 |
| 44483.291666666664 | 5.41 |
| 44483.302083333336 | 5.36 |
| 44483.3125 | 5.37 |
| 44483.322916666664 | 5.46 |
| 44483.333333333336 | 5.52 |
| 44483.34375 | 5.58 |
| 44483.354166666664 | 5.57 |
| 44483.364583333336 | 5.59 |
| 44483.375 | 5.52 |
| 44483.385416666664 | 5.34 |
| 44483.395833333336 | 5.31 |
| 44483.40625 | 5.22 |
| 44483.416666666664 | 5.17 |
| 44483.427083333336 | 5.07 |
| 44483.4375 | 5.15 |
| 44483.447916666664 | 4.93 |
| 44483.458333333336 | 4.96 |
| 44483.46875 | 4.14 |
| 44483.479166666664 | 4.86 |
| 44483.489583333336 | 4.58 |
| 44483.5 | 4.67 |
| 44483.510416666664 | 4.74 |
| 44483.520833333336 | 4.66 |
| 44483.53125 | 4.1 |
| 44483.541666666664 | 4.49 |
| 44483.552083333336 | 4.45 |
| 44483.5625 | 4.23 |
| 44483.572916666664 | 4.44 |
| 44483.583333333336 | 4.43 |
| 44483.59375 | 4.43 |
| 44483.604166666664 | 4.54 |
| 44483.614583333336 | 4.43 |
| 44483.625 | 4.41 |
| 44483.635416666664 | 4.45 |
| 44483.645833333336 | 4.55 |
| 44483.65625 | 4.68 |
| 44483.666666666664 | 4.77 |
| 44483.677083333336 | 5.08 |
| 44483.6875 | 5.36 |
| 44483.697916666664 | 5.65 |
| 44483.708333333336 | 5.78 |
| 44483.71875 | 5.87 |
| 44483.729166666664 | 5.98 |
| 44483.739583333336 | 6.16 |
| 44483.75 | 6.2 |
| 44483.760416666664 | 6.27 |
| 44483.770833333336 | 6.34 |
| 44483.78125 | 6.44 |
| 44483.791666666664 | 6.49 |
| 44483.802083333336 | 6.47 |
| 44483.8125 | 6.42 |
| 44483.822916666664 | 6.37 |
| 44483.833333333336 | 6.32 |
| 44483.84375 | 6.28 |
| 44483.854166666664 | 6.25 |
| 44483.864583333336 | 6.22 |
| 44483.875 | 6.18 |
| 44483.885416666664 | 6.12 |
| 44483.895833333336 | 6.21 |
| 44483.90625 | 6.26 |
| 44483.916666666664 | 6.32 |
| 44483.927083333336 | 6.41 |
| 44483.9375 | 6.57 |
| 44483.947916666664 | 6.41 |
| 44483.958333333336 | 6.29 |
| 44483.96875 | 6.25 |
| 44483.979166666664 | 6.3 |
| 44483.989583333336 | 6.17 |
| 44484.0 | 6.05 |
| 44484.010416666664 | 5.98 |
| 44484.020833333336 | 5.77 |
| 44484.03125 | 5.38 |
| 44484.041666666664 | 5.57 |
| 44484.052083333336 | 5.6 |
| 44484.0625 | 5.67 |
| 44484.072916666664 | 5.67 |
| 44484.083333333336 | 5.78 |
| 44484.09375 | 5.18 |
| 44484.104166666664 | 5.18 |
| 44484.114583333336 | 4.87 |
| 44484.125 | 5.31 |
| 44484.135416666664 | 5.67 |
| 44484.145833333336 | 5.16 |
| 44484.15625 | 5.18 |
| 44484.166666666664 | 5.29 |
| 44484.177083333336 | 5.39 |
| 44484.1875 | 5.44 |
| 44484.197916666664 | 5.53 |
| 44484.208333333336 | 5.55 |
| 44484.21875 | 5.57 |
| 44484.229166666664 | 5.49 |
| 44484.239583333336 | 5.51 |
| 44484.25 | 5.54 |
| 44484.260416666664 | 5.57 |
| 44484.270833333336 | 5.57 |
| 44484.28125 | 5.56 |
| 44484.291666666664 | 5.56 |
| 44484.302083333336 | 5.56 |
| 44484.3125 | 5.52 |
| 44484.322916666664 | 5.54 |
| 44484.333333333336 | 5.54 |
| 44484.34375 | 5.54 |
| 44484.354166666664 | 5.52 |
| 44484.364583333336 | 5.5 |
| 44484.375 | 5.57 |
| 44484.385416666664 | 5.58 |
| 44484.395833333336 | 5.57 |
| 44484.40625 | 5.49 |
| 44484.416666666664 | 5.56 |
| 44484.427083333336 | 5.52 |
| 44484.4375 | 5.49 |
| 44484.447916666664 | 5.29 |
| 44484.458333333336 | 4.27 |
| 44484.46875 | 5.24 |
| 44484.479166666664 | 5.08 |
| 44484.489583333336 | 5.05 |
| 44484.5 | 4.85 |
| 44484.510416666664 | 3.74 |
| 44484.520833333336 | 4.5 |
| 44484.53125 | 4.5 |
| 44484.541666666664 | 4.99 |
| 44484.552083333336 | 4.95 |
| 44484.5625 | 4.94 |
| 44484.572916666664 | 4.6 |
| 44484.583333333336 | 4.62 |
| 44484.59375 | 4.76 |
| 44484.604166666664 | 4.8 |
| 44484.614583333336 | 5.05 |
| 44484.625 | 5.06 |
| 44484.635416666664 | 5.12 |
| 44484.645833333336 | 5.18 |
| 44484.65625 | 4.91 |
| 44484.666666666664 | 4.89 |
| 44484.677083333336 | 4.95 |
| 44484.6875 | 5.13 |
| 44484.697916666664 | 5.22 |
| 44484.708333333336 | 5.31 |
| 44484.71875 | 5.62 |
| 44484.729166666664 | 5.9 |
| 44484.739583333336 | 6.07 |
| 44484.75 | 6.14 |
| 44484.760416666664 | 6.24 |
| 44484.770833333336 | 6.35 |
| 44484.78125 | 6.56 |
| 44484.791666666664 | 6.6 |
| 44484.802083333336 | 6.69 |
| 44484.8125 | 6.72 |
| 44484.822916666664 | 6.71 |
| 44484.833333333336 | 6.76 |
| 44484.84375 | 6.69 |
| 44484.854166666664 | 6.6 |
| 44484.864583333336 | 6.51 |
| 44484.875 | 6.46 |
| 44484.885416666664 | 6.4 |
| 44484.895833333336 | 6.36 |
| 44484.90625 | 6.33 |
| 44484.916666666664 | 6.31 |
| 44484.927083333336 | 6.25 |
| 44484.9375 | 6.33 |
| 44484.947916666664 | 6.03 |
| 44484.958333333336 | 6.08 |
| 44484.96875 | 6.08 |
| 44484.979166666664 | 6.26 |
| 44484.989583333336 | 6.15 |
| 44485.0 | 6.24 |
| 44485.010416666664 | 6.22 |
| 44485.020833333336 | 6.1 |
| 44485.03125 | 5.98 |
| 44485.041666666664 | 5.87 |
| 44485.052083333336 | 5.87 |
| 44485.0625 | 5.83 |
| 44485.072916666664 | 5.5 |
| 44485.083333333336 | 5.63 |
| 44485.09375 | 5.74 |
| 44485.104166666664 | 5.7 |
| 44485.114583333336 | 5.88 |
| 44485.125 | 5.53 |
| 44485.135416666664 | 5.66 |
| 44485.145833333336 | 5.88 |
| 44485.15625 | 5.07 |
| 44485.166666666664 | 5.85 |
| 44485.177083333336 | 5.82 |
| 44485.1875 | 5.05 |
| 44485.197916666664 | 5.13 |
| 44485.208333333336 | 5.34 |
| 44485.21875 | 5.43 |
| 44485.229166666664 | 5.45 |
| 44485.239583333336 | 5.52 |
| 44485.25 | 5.59 |
| 44485.260416666664 | 5.55 |
| 44485.270833333336 | 5.56 |
| 44485.28125 | 5.56 |
| 44485.291666666664 | 5.55 |
| 44485.302083333336 | 5.57 |
| 44485.3125 | 5.56 |
| 44485.322916666664 | 5.57 |
| 44485.333333333336 | 5.55 |
| 44485.34375 | 5.57 |
| 44485.354166666664 | 5.56 |
| 44485.364583333336 | 5.59 |
| 44485.375 | 5.56 |
| 44485.385416666664 | 5.64 |
| 44485.395833333336 | 5.63 |
| 44485.40625 | 5.63 |
| 44485.416666666664 | 5.64 |
| 44485.427083333336 | 5.64 |
| 44485.4375 | 5.68 |
| 44485.447916666664 | 5.61 |
| 44485.458333333336 | 5.69 |
| 44485.46875 | 5.67 |
| 44485.479166666664 | 5.6 |
| 44485.489583333336 | 5.64 |
| 44485.5 | 5.57 |
| 44485.510416666664 | 5.47 |
| 44485.520833333336 | 5.47 |
| 44485.53125 | 5.47 |
| 44485.541666666664 | 5.32 |
| 44485.552083333336 | 5.48 |
| 44485.5625 | 5.48 |
| 44485.572916666664 | 5.51 |
| 44485.583333333336 | 5.68 |
| 44485.59375 | 5.75 |
| 44485.604166666664 | 5.84 |
| 44485.614583333336 | 5.79 |
| 44485.625 | 6.09 |
| 44485.635416666664 | 6.13 |
| 44485.645833333336 | 6.22 |
| 44485.65625 | 6.24 |
| 44485.666666666664 | 6.33 |
| 44485.677083333336 | 6.4 |
| 44485.6875 | 6.34 |
| 44485.697916666664 | 6.12 |
| 44485.708333333336 | 6.02 |
| 44485.71875 | 6.06 |
| 44485.729166666664 | 6.15 |
| 44485.739583333336 | 6.16 |
| 44485.75 | 6.37 |
| 44485.760416666664 | 6.61 |
| 44485.770833333336 | 6.9 |
| 44485.78125 | 6.98 |
| 44485.791666666664 | 7.19 |
| 44485.802083333336 | 7.36 |
| 44485.8125 | 7.44 |
| 44485.822916666664 | 7.44 |
| 44485.833333333336 | 7.43 |
| 44485.84375 | 7.4 |
| 44485.854166666664 | 7.4 |
| 44485.864583333336 | 7.41 |
| 44485.875 | 7.37 |
| 44485.885416666664 | 7.32 |
| 44485.895833333336 | 7.25 |
| 44485.90625 | 7.18 |
| 44485.916666666664 | 7.11 |
| 44485.927083333336 | 7.03 |
| 44485.9375 | 6.94 |
| 44485.947916666664 | 6.81 |
| 44485.958333333336 | 6.78 |
| 44485.96875 | 6.68 |
| 44485.979166666664 | 6.76 |
| 44485.989583333336 | 6.73 |
| 44486.0 | 6.74 |
| 44486.010416666664 | 6.66 |
| 44486.020833333336 | 6.69 |
| 44486.03125 | 6.53 |
| 44486.041666666664 | 6.58 |
| 44486.052083333336 | 6.53 |
| 44486.0625 | 6.34 |
| 44486.072916666664 | 6.1 |
| 44486.083333333336 | 5.96 |
| 44486.09375 | 5.69 |
| 44486.104166666664 | 5.44 |
| 44486.114583333336 | 5.55 |
| 44486.125 | 5.52 |
| 44486.135416666664 | 5.79 |
| 44486.145833333336 | 5.86 |
| 44486.15625 | 5.85 |
| 44486.166666666664 | 5.76 |
| 44486.177083333336 | 5.9 |
| 44486.1875 | 5.98 |
| 44486.197916666664 | 5.66 |
| 44486.208333333336 | 5.52 |
| 44486.21875 | 5.81 |
| 44486.229166666664 | 5.85 |
| 44486.239583333336 | 5.84 |
| 44486.25 | 5.86 |
| 44486.260416666664 | 5.82 |
| 44486.270833333336 | 5.84 |
| 44486.28125 | 5.83 |
| 44486.291666666664 | 5.76 |
| 44486.302083333336 | 5.84 |
| 44486.3125 | 5.93 |
| 44486.322916666664 | 5.98 |
| 44486.333333333336 | 6 |
| 44486.34375 | 6.03 |
| 44486.354166666664 | 6.07 |
| 44486.364583333336 | 6.11 |
| 44486.375 | 6.12 |
| 44486.385416666664 | 6.14 |
| 44486.395833333336 | 6.15 |
| 44486.40625 | 6.17 |
| 44486.416666666664 | 6.14 |
| 44486.427083333336 | 6.13 |
| 44486.4375 | 6.13 |
| 44486.447916666664 | 6.08 |
| 44486.458333333336 | 6.14 |
| 44486.46875 | 6.16 |
| 44486.479166666664 | 6.22 |
| 44486.489583333336 | 6.22 |
| 44486.5 | 6.2 |
| 44486.510416666664 | 6.25 |
| 44486.520833333336 | 6.07 |
| 44486.53125 | 6.09 |
| 44486.541666666664 | 6.08 |
| 44486.552083333336 | 6 |
| 44486.5625 | 5.95 |
| 44486.572916666664 | 5.99 |
| 44486.583333333336 | 5.99 |
| 44486.59375 | 6 |
| 44486.604166666664 | 6.08 |
| 44486.614583333336 | 6.27 |
| 44486.625 | 6.49 |
| 44486.635416666664 | 6.58 |
| 44486.645833333336 | 6.78 |
| 44486.65625 | 6.91 |
| 44486.666666666664 | 7.04 |
| 44486.677083333336 | 7.16 |
| 44486.6875 | 7.17 |
| 44486.697916666664 | 7.22 |
| 44486.708333333336 | 7.27 |
| 44486.71875 | 6.88 |
| 44486.729166666664 | 7.04 |
| 44486.739583333336 | 6.93 |
| 44486.75 | 7.09 |
| 44486.760416666664 | 7 |
| 44486.770833333336 | 6.94 |
| 44486.78125 | 6.91 |
| 44486.791666666664 | 6.91 |
| 44486.802083333336 | 6.97 |
| 44486.8125 | 7.09 |
| 44486.822916666664 | 7.21 |
| 44486.833333333336 | 7.36 |
| 44486.84375 | 7.5 |
| 44486.854166666664 | 7.54 |
| 44486.864583333336 | 7.6 |
| 44486.875 | 7.68 |
| 44486.885416666664 | 7.77 |
| 44486.895833333336 | 7.77 |
| 44486.90625 | 7.7 |
| 44486.916666666664 | 7.61 |
| 44486.927083333336 | 7.51 |
| 44486.9375 | 7.39 |
| 44486.947916666664 | 7.26 |
| 44486.958333333336 | 7.15 |
| 44486.96875 | 7.07 |
| 44486.979166666664 | 7.04 |
| 44486.989583333336 | 7.03 |
| 44487.0 | 6.98 |
| 44487.010416666664 | 7.01 |
| 44487.020833333336 | 7.05 |
| 44487.03125 | 7.05 |
| 44487.041666666664 | 7.06 |
| 44487.052083333336 | 7.07 |
| 44487.0625 | 6.95 |
| 44487.072916666664 | 6.94 |
| 44487.083333333336 | 6.89 |
| 44487.09375 | 6.8 |
| 44487.104166666664 | 6.71 |
| 44487.114583333336 | 6.51 |
| 44487.125 | 6.52 |
| 44487.135416666664 | 6.54 |
| 44487.145833333336 | 6.51 |
| 44487.15625 | 6.57 |
| 44487.166666666664 | 6.51 |
| 44487.177083333336 | 6.63 |
| 44487.1875 | 6.51 |
| 44487.197916666664 | 6.68 |
| 44487.208333333336 | 6.53 |
| 44487.21875 | 6.61 |
| 44487.229166666664 | 6.68 |
| 44487.239583333336 | 6.68 |
| 44487.25 | 6.79 |
| 44487.260416666664 | 6.57 |
| 44487.270833333336 | 6.3 |
| 44487.28125 | 6.47 |
| 44487.291666666664 | 6.49 |
| 44487.302083333336 | 6.49 |
| 44487.3125 | 6.49 |
| 44487.322916666664 | 6.48 |
| 44487.333333333336 | 6.45 |
| 44487.34375 | 6.41 |
| 44487.354166666664 | 6.45 |
| 44487.364583333336 | 6.47 |
| 44487.375 | 6.46 |
| 44487.385416666664 | 6.47 |
| 44487.395833333336 | 6.47 |
| 44487.40625 | 6.5 |
| 44487.416666666664 | 6.54 |
| 44487.427083333336 | 6.53 |
| 44487.4375 | 6.52 |
| 44487.447916666664 | 6.5 |
| 44487.458333333336 | 6.47 |
| 44487.46875 | 6.48 |
| 44487.479166666664 | 6.52 |
| 44487.489583333336 | 6.53 |
| 44487.5 | 6.53 |
| 44487.510416666664 | 6.51 |
| 44487.520833333336 | 6.48 |
| 44487.53125 | 6.55 |
| 44487.541666666664 | 6.52 |
| 44487.552083333336 | 6.53 |
| 44487.5625 | 6.58 |
| 44487.572916666664 | 6.52 |
| 44487.583333333336 | 6.58 |
| 44487.59375 | 6.63 |
| 44487.604166666664 | 6.69 |
| 44487.614583333336 | 6.8 |
| 44487.625 | 6.89 |
| 44487.635416666664 | 7.04 |
| 44487.645833333336 | 7.21 |
| 44487.65625 | 7.36 |
| 44487.666666666664 | 7.46 |
| 44487.677083333336 | 7.56 |
| 44487.6875 | 7.63 |
| 44487.697916666664 | 7.7 |
| 44487.708333333336 | 7.75 |
| 44487.71875 | 7.79 |
| 44487.729166666664 | 7.73 |
| 44487.739583333336 | 7.81 |
| 44487.75 | 7.86 |
| 44487.760416666664 | 7.7 |
| 44487.770833333336 | 7.51 |
| 44487.78125 | 7.67 |
| 44487.791666666664 | 7.62 |
| 44487.802083333336 | 7.61 |
| 44487.8125 | 7.59 |
| 44487.822916666664 | 7.58 |
| 44487.833333333336 | 7.62 |
| 44487.84375 | 7.71 |
| 44487.854166666664 | 7.9 |
| 44487.864583333336 | 8.03 |
| 44487.875 | 8.08 |
| 44487.885416666664 | 8.09 |
| 44487.895833333336 | 8.01 |
| 44487.90625 | 7.93 |
| 44487.916666666664 | 7.81 |
| 44487.927083333336 | 7.71 |
| 44487.9375 | 7.61 |
| 44487.947916666664 | 7.51 |
| 44487.958333333336 | 7.45 |
| 44487.96875 | 7.37 |
| 44487.979166666664 | 7.31 |
| 44487.989583333336 | 7.27 |
| 44488.0 | 7.23 |
| 44488.010416666664 | 7.18 |
| 44488.020833333336 | 7.15 |
| 44488.03125 | 7.23 |
| 44488.041666666664 | 7.2 |
| 44488.052083333336 | 7.16 |
| 44488.0625 | 7.12 |
| 44488.072916666664 | 7.16 |
| 44488.083333333336 | 7.09 |
| 44488.09375 | 7.1 |
| 44488.104166666664 | 7.1 |
| 44488.114583333336 | 7.03 |
| 44488.125 | 7.02 |
| 44488.135416666664 | 6.96 |
| 44488.145833333336 | 7.03 |
| 44488.15625 | 6.98 |
| 44488.166666666664 | 6.99 |
| 44488.177083333336 | 6.98 |
| 44488.1875 | 6.91 |
| 44488.197916666664 | 6.93 |
| 44488.208333333336 | 6.83 |
| 44488.21875 | 6.83 |
| 44488.229166666664 | 6.8 |
| 44488.239583333336 | 6.76 |
| 44488.25 | 6.77 |
| 44488.260416666664 | 6.85 |
| 44488.270833333336 | 6.93 |
| 44488.28125 | 6.74 |
| 44488.291666666664 | 6.56 |
| 44488.302083333336 | 6.72 |
| 44488.3125 | 6.7 |
| 44488.322916666664 | 6.7 |
| 44488.333333333336 | 6.71 |
| 44488.34375 | 6.69 |
| 44488.354166666664 | 6.66 |
| 44488.364583333336 | 6.65 |
| 44488.375 | 6.67 |
| 44488.385416666664 | 6.65 |
| 44488.395833333336 | 6.62 |
| 44488.40625 | 6.59 |
| 44488.416666666664 | 6.56 |
| 44488.427083333336 | 6.56 |
| 44488.4375 | 6.56 |
| 44488.447916666664 | 6.55 |
| 44488.458333333336 | 6.54 |
| 44488.46875 | 6.54 |
| 44488.479166666664 | 6.53 |
| 44488.489583333336 | 6.54 |
| 44488.5 | 6.52 |
| 44488.510416666664 | 6.55 |
| 44488.520833333336 | 6.51 |
| 44488.53125 | 6.52 |
| 44488.541666666664 | 6.54 |
| 44488.552083333336 | 6.56 |
| 44488.5625 | 6.57 |
| 44488.572916666664 | 6.6 |
| 44488.583333333336 | 6.63 |
| 44488.59375 | 6.64 |
| 44488.604166666664 | 6.7 |
| 44488.614583333336 | 6.75 |
| 44488.625 | 6.82 |
| 44488.635416666664 | 6.98 |
| 44488.645833333336 | 6.99 |
| 44488.65625 | 7.16 |
| 44488.666666666664 | 7.3 |
| 44488.677083333336 | 7.5 |
| 44488.6875 | 7.62 |
| 44488.697916666664 | 7.81 |
| 44488.708333333336 | 7.91 |
| 44488.71875 | 7.92 |
| 44488.729166666664 | 7.93 |
| 44488.739583333336 | 8.01 |
| 44488.75 | 8.03 |
| 44488.760416666664 | 8.02 |
| 44488.770833333336 | 8.02 |
| 44488.78125 | 8.1 |
| 44488.791666666664 | 7.87 |
| 44488.802083333336 | 7.81 |
| 44488.8125 | 7.89 |
| 44488.822916666664 | 7.82 |
| 44488.833333333336 | 7.8 |
| 44488.84375 | 7.83 |
| 44488.854166666664 | 7.81 |
| 44488.864583333336 | 7.89 |
| 44488.875 | 7.96 |
| 44488.885416666664 | 8.04 |
| 44488.895833333336 | 8.11 |
| 44488.90625 | 8.18 |
| 44488.916666666664 | 8.23 |
| 44488.927083333336 | 8.18 |
| 44488.9375 | 8.13 |
| 44488.947916666664 | 8.05 |
| 44488.958333333336 | 7.98 |
| 44488.96875 | 7.88 |
| 44488.979166666664 | 7.77 |
| 44488.989583333336 | 7.69 |
| 44489.0 | 7.61 |
| 44489.010416666664 | 7.53 |
| 44489.020833333336 | 7.47 |
| 44489.03125 | 7.44 |
| 44489.041666666664 | 7.39 |
| 44489.052083333336 | 7.35 |
| 44489.0625 | 7.36 |
| 44489.072916666664 | 7.41 |
| 44489.083333333336 | 7.39 |
| 44489.09375 | 7.36 |
| 44489.104166666664 | 7.33 |
| 44489.114583333336 | 7.27 |
| 44489.125 | 7.29 |
| 44489.135416666664 | 7.25 |
| 44489.145833333336 | 7.22 |
| 44489.15625 | 7.22 |
| 44489.166666666664 | 7.4 |
| 44489.177083333336 | 7.34 |
| 44489.1875 | 7.27 |
| 44489.197916666664 | 7.18 |
| 44489.208333333336 | 7.1 |
| 44489.21875 | 7.01 |
| 44489.229166666664 | 6.94 |
| 44489.239583333336 | 6.91 |
| 44489.25 | 6.94 |
| 44489.260416666664 | 6.95 |
| 44489.270833333336 | 6.9 |
| 44489.28125 | 6.91 |
| 44489.291666666664 | 6.88 |
| 44489.302083333336 | 6.85 |
| 44489.3125 | 6.92 |
| 44489.322916666664 | 6.8 |
| 44489.333333333336 | 6.83 |
| 44489.34375 | 6.82 |
| 44489.354166666664 | 6.84 |
| 44489.364583333336 | 6.8 |
| 44489.375 | 6.8 |
| 44489.385416666664 | 6.78 |
| 44489.395833333336 | 6.77 |
| 44489.40625 | 6.76 |
| 44489.416666666664 | 6.75 |
| 44489.427083333336 | 6.74 |
| 44489.4375 | 6.7 |
| 44489.447916666664 | 6.68 |
| 44489.458333333336 | 6.67 |
| 44489.46875 | 6.68 |
| 44489.479166666664 | 6.67 |
| 44489.489583333336 | 6.68 |
| 44489.5 | 6.66 |
| 44489.510416666664 | 6.65 |
| 44489.520833333336 | 6.64 |
| 44489.53125 | 6.63 |
| 44489.541666666664 | 6.63 |
| 44489.552083333336 | 6.63 |
| 44489.5625 | 6.62 |
| 44489.572916666664 | 6.64 |
| 44489.583333333336 | 6.7 |
| 44489.59375 | 6.74 |
| 44489.604166666664 | 6.77 |
| 44489.614583333336 | 6.85 |
| 44489.625 | 6.95 |
| 44489.635416666664 | 6.96 |
| 44489.645833333336 | 7.1 |
| 44489.65625 | 7.19 |
| 44489.666666666664 | 7.27 |
| 44489.677083333336 | 7.49 |
| 44489.6875 | 7.64 |
| 44489.697916666664 | 7.74 |
| 44489.708333333336 | 7.9 |
| 44489.71875 | 7.91 |
| 44489.729166666664 | 7.77 |
| 44489.739583333336 | 7.96 |
| 44489.75 | 7.94 |
| 44489.760416666664 | 7.98 |
| 44489.770833333336 | 7.94 |
| 44489.78125 | 8.02 |
| 44489.791666666664 | 8 |
| 44489.802083333336 | 8.06 |
| 44489.8125 | 7.98 |
| 44489.822916666664 | 7.98 |
| 44489.833333333336 | 7.84 |
| 44489.84375 | 7.87 |
| 44489.854166666664 | 7.79 |
| 44489.864583333336 | 7.75 |
| 44489.875 | 7.79 |
| 44489.885416666664 | 7.82 |
| 44489.895833333336 | 7.89 |
| 44489.90625 | 7.97 |
| 44489.916666666664 | 8.12 |
| 44489.927083333336 | 8.33 |
| 44489.9375 | 8.41 |
| 44489.947916666664 | 8.42 |
| 44489.958333333336 | 8.4 |
| 44489.96875 | 8.34 |
| 44489.979166666664 | 8.27 |
| 44489.989583333336 | 8.19 |
| 44490.0 | 8.09 |
| 44490.010416666664 | 7.98 |
| 44490.020833333336 | 7.89 |
| 44490.03125 | 7.78 |
| 44490.041666666664 | 7.71 |
| 44490.052083333336 | 7.63 |
| 44490.0625 | 7.58 |
| 44490.072916666664 | 7.51 |
| 44490.083333333336 | 7.51 |
| 44490.09375 | 7.51 |
| 44490.104166666664 | 7.49 |
| 44490.114583333336 | 7.51 |
| 44490.125 | 7.46 |
| 44490.135416666664 | 7.42 |
| 44490.145833333336 | 7.34 |
| 44490.15625 | 7.31 |
| 44490.166666666664 | 7.21 |
| 44490.177083333336 | 7.14 |
| 44490.1875 | 7.24 |
| 44490.197916666664 | 7.07 |
| 44490.208333333336 | 7.25 |
| 44490.21875 | 7.12 |
| 44490.229166666664 | 7.04 |
| 44490.239583333336 | 6.91 |
| 44490.25 | 6.91 |
| 44490.260416666664 | 6.87 |
| 44490.270833333336 | 6.88 |
| 44490.28125 | 6.9 |
| 44490.291666666664 | 6.85 |
| 44490.302083333336 | 6.93 |
| 44490.3125 | 6.98 |
| 44490.322916666664 | 6.81 |
| 44490.333333333336 | 6.78 |
| 44490.34375 | 6.83 |
| 44490.354166666664 | 6.8 |
| 44490.364583333336 | 6.78 |
| 44490.375 | 6.82 |
| 44490.385416666664 | 6.83 |
| 44490.395833333336 | 6.83 |
| 44490.40625 | 6.84 |
| 44490.416666666664 | 6.84 |
| 44490.427083333336 | 6.83 |
| 44490.4375 | 6.84 |
| 44490.447916666664 | 6.82 |
| 44490.458333333336 | 6.79 |
| 44490.46875 | 6.77 |
| 44490.479166666664 | 6.78 |
| 44490.489583333336 | 6.77 |
| 44490.5 | 6.74 |
| 44490.510416666664 | 6.72 |
| 44490.520833333336 | 6.7 |
| 44490.53125 | 6.7 |
| 44490.541666666664 | 6.7 |
| 44490.552083333336 | 6.7 |
| 44490.5625 | 6.72 |
| 44490.572916666664 | 6.74 |
| 44490.583333333336 | 6.75 |
| 44490.59375 | 6.75 |
| 44490.604166666664 | 6.78 |
| 44490.614583333336 | 6.84 |
| 44490.625 | 6.9 |
| 44490.635416666664 | 7.06 |
| 44490.645833333336 | 7.25 |
| 44490.65625 | 7.24 |
| 44490.666666666664 | 7.4 |
| 44490.677083333336 | 7.44 |
| 44490.6875 | 7.54 |
| 44490.697916666664 | 7.62 |
| 44490.708333333336 | 7.59 |
| 44490.71875 | 7.74 |
| 44490.729166666664 | 7.83 |
| 44490.739583333336 | 7.96 |
| 44490.75 | 8.07 |
| 44490.760416666664 | 8.21 |
| 44490.770833333336 | 8.21 |
| 44490.78125 | 8.27 |
| 44490.791666666664 | 8.3 |
| 44490.802083333336 | 8.28 |
| 44490.8125 | 8.27 |
| 44490.822916666664 | 8.23 |
| 44490.833333333336 | 8.23 |
| 44490.84375 | 8.22 |
| 44490.854166666664 | 8.05 |
| 44490.864583333336 | 7.95 |
| 44490.875 | 7.99 |
| 44490.885416666664 | 7.91 |
| 44490.895833333336 | 7.86 |
| 44490.90625 | 7.83 |
| 44490.916666666664 | 7.82 |
| 44490.927083333336 | 7.79 |
| 44490.9375 | 7.76 |
| 44490.947916666664 | 7.73 |
| 44490.958333333336 | 7.68 |
| 44490.96875 | 7.64 |
| 44490.979166666664 | 7.63 |
| 44490.989583333336 | 7.62 |
| 44491.0 | 7.62 |
| 44491.010416666664 | 7.63 |
| 44491.020833333336 | 7.62 |
| 44491.03125 | 7.61 |
| 44491.041666666664 | 7.58 |
| 44491.052083333336 | 7.57 |
| 44491.0625 | 7.57 |
| 44491.072916666664 | 7.55 |
| 44491.083333333336 | 7.56 |
| 44491.09375 | 7.48 |
| 44491.104166666664 | 7.32 |
| 44491.114583333336 | 7.37 |
| 44491.125 | 7.41 |
| 44491.135416666664 | 7.4 |
| 44491.145833333336 | 7.31 |
| 44491.15625 | 7.19 |
| 44491.166666666664 | 7.06 |
| 44491.177083333336 | 6.84 |
| 44491.1875 | 6.81 |
| 44491.197916666664 | 6.65 |
| 44491.208333333336 | 6.88 |
| 44491.21875 | 6.89 |
| 44491.229166666664 | 6.84 |
| 44491.239583333336 | 6.87 |
| 44491.25 | 6.85 |
| 44491.260416666664 | 6.81 |
| 44491.270833333336 | 6.78 |
| 44491.28125 | 6.78 |
| 44491.291666666664 | 6.77 |
| 44491.302083333336 | 6.7 |
| 44491.3125 | 6.71 |
| 44491.322916666664 | 6.72 |
| 44491.333333333336 | 6.72 |
| 44491.34375 | 6.62 |
| 44491.354166666664 | 6.6 |
| 44491.364583333336 | 6.57 |
| 44491.375 | 6.59 |
| 44491.385416666664 | 6.56 |
| 44491.395833333336 | 6.55 |
| 44491.40625 | 6.62 |
| 44491.416666666664 | 6.62 |
| 44491.427083333336 | 6.63 |
| 44491.4375 | 6.62 |
| 44491.447916666664 | 6.61 |
| 44491.458333333336 | 6.61 |
| 44491.46875 | 6.61 |
| 44491.479166666664 | 6.62 |
| 44491.489583333336 | 6.63 |
| 44491.5 | 6.64 |
| 44491.510416666664 | 6.68 |
| 44491.520833333336 | 6.72 |
| 44491.53125 | 6.76 |
| 44491.541666666664 | 6.77 |
| 44491.552083333336 | 6.78 |
| 44491.5625 | 6.79 |
| 44491.572916666664 | 6.79 |
| 44491.583333333336 | 6.79 |
| 44491.59375 | 6.8 |
| 44491.604166666664 | 6.8 |
| 44491.614583333336 | 6.79 |
| 44491.625 | 6.79 |
| 44491.635416666664 | 6.87 |
| 44491.645833333336 | 6.84 |
| 44491.65625 | 6.84 |
| 44491.666666666664 | 6.9 |
| 44491.677083333336 | 6.88 |
| 44491.6875 | 6.94 |
| 44491.697916666664 | 6.95 |
| 44491.708333333336 | 6.9 |
| 44491.71875 | 6.97 |
| 44491.729166666664 | 7.04 |
| 44491.739583333336 | 7.14 |
| 44491.75 | 7.26 |
| 44491.760416666664 | 7.33 |
| 44491.770833333336 | 7.42 |
| 44491.78125 | 7.51 |
| 44491.791666666664 | 7.58 |
| 44491.802083333336 | 7.57 |
| 44491.8125 | 7.62 |
| 44491.822916666664 | 7.59 |
| 44491.833333333336 | 7.57 |
| 44491.84375 | 7.47 |
| 44491.854166666664 | 7.34 |
| 44491.864583333336 | 7.24 |
| 44491.875 | 7.23 |
| 44491.885416666664 | 7.14 |
| 44491.895833333336 | 7.08 |
| 44491.90625 | 7.08 |
| 44491.916666666664 | 7.05 |
| 44491.927083333336 | 7.1 |
| 44491.9375 | 7.21 |
| 44491.947916666664 | 7.21 |
| 44491.958333333336 | 7.26 |
| 44491.96875 | 7.26 |
| 44491.979166666664 | 7.26 |
| 44491.989583333336 | 7.25 |
| 44492.0 | 7.25 |
| 44492.010416666664 | 7.26 |
| 44492.020833333336 | 7.25 |
| 44492.03125 | 7.27 |
| 44492.041666666664 | 7.28 |
| 44492.052083333336 | 7.28 |
| 44492.0625 | 7.26 |
| 44492.072916666664 | 7.28 |
| 44492.083333333336 | 7.26 |
| 44492.09375 | 7.24 |
| 44492.104166666664 | 7.18 |
| 44492.114583333336 | 7.14 |
| 44492.125 | 7.09 |
| 44492.135416666664 | 7.1 |
| 44492.145833333336 | 7.06 |
| 44492.15625 | 7.13 |
| 44492.166666666664 | 6.97 |
| 44492.177083333336 | 6.82 |
| 44492.1875 | 6.69 |
| 44492.197916666664 | 6.54 |
| 44492.208333333336 | 6.43 |
| 44492.21875 | 6.41 |
| 44492.229166666664 | 6.29 |
| 44492.239583333336 | 6.33 |
| 44492.25 | 6.4 |
| 44492.260416666664 | 6.54 |
| 44492.270833333336 | 6.33 |
| 44492.28125 | 6.42 |
| 44492.291666666664 | 6.33 |
| 44492.302083333336 | 6.31 |
| 44492.3125 | 6.32 |
| 44492.322916666664 | 6.25 |
| 44492.333333333336 | 6.32 |
| 44492.34375 | 6.33 |
| 44492.354166666664 | 6.29 |
| 44492.364583333336 | 6.28 |
| 44492.375 | 6.09 |
| 44492.385416666664 | 6.01 |
| 44492.395833333336 | 6.07 |
| 44492.40625 | 6.1 |
| 44492.416666666664 | 6.13 |
| 44492.427083333336 | 6.15 |
| 44492.4375 | 6.2 |
| 44492.447916666664 | 6.26 |
| 44492.458333333336 | 6.33 |
| 44492.46875 | 6.35 |
| 44492.479166666664 | 6.38 |
| 44492.489583333336 | 6.36 |
| 44492.5 | 6.38 |
| 44492.510416666664 | 6.39 |
| 44492.520833333336 | 6.4 |
| 44492.53125 | 6.39 |
| 44492.541666666664 | 6.41 |
| 44492.552083333336 | 6.42 |
| 44492.5625 | 6.42 |
| 44492.572916666664 | 6.42 |
| 44492.583333333336 | 6.46 |
| 44492.59375 | 6.49 |
| 44492.604166666664 | 6.51 |
| 44492.614583333336 | 6.51 |
| 44492.625 | 6.52 |
| 44492.635416666664 | 6.57 |
| 44492.645833333336 | 6.59 |
| 44492.65625 | 6.62 |
| 44492.666666666664 | 6.64 |
| 44492.677083333336 | 6.69 |
| 44492.6875 | 6.86 |
| 44492.697916666664 | 6.99 |
| 44492.708333333336 | 7.13 |
| 44492.71875 | 7.1 |
| 44492.729166666664 | 7.11 |
| 44492.739583333336 | 7.07 |
| 44492.75 | 7.25 |
| 44492.760416666664 | 7.32 |
| 44492.770833333336 | 7.47 |
| 44492.78125 | 7.57 |
| 44492.791666666664 | 7.6 |
| 44492.802083333336 | 7.72 |
| 44492.8125 | 7.79 |
| 44492.822916666664 | 7.86 |
| 44492.833333333336 | 7.9 |
| 44492.84375 | 7.85 |
| 44492.854166666664 | 7.88 |
| 44492.864583333336 | 7.81 |
| 44492.875 | 7.75 |
| 44492.885416666664 | 7.69 |
| 44492.895833333336 | 7.62 |
| 44492.90625 | 7.55 |
| 44492.916666666664 | 7.44 |
| 44492.927083333336 | 7.32 |
| 44492.9375 | 7.32 |
| 44492.947916666664 | 7.3 |
| 44492.958333333336 | 7.29 |
| 44492.96875 | 7.32 |
| 44492.979166666664 | 7.34 |
| 44492.989583333336 | 7.28 |
| 44493.0 | 7.24 |
| 44493.010416666664 | 7.22 |
| 44493.020833333336 | 7.2 |
| 44493.03125 | 7.16 |
| 44493.041666666664 | 7.13 |
| 44493.052083333336 | 7.12 |
| 44493.0625 | 7.1 |
| 44493.072916666664 | 7.06 |
| 44493.083333333336 | 7.04 |
| 44493.09375 | 7.04 |
| 44493.104166666664 | 6.99 |
| 44493.114583333336 | 6.97 |
| 44493.125 | 6.94 |
| 44493.135416666664 | 6.91 |
| 44493.145833333336 | 6.85 |
| 44493.15625 | 6.81 |
| 44493.166666666664 | 6.74 |
| 44493.177083333336 | 6.88 |
| 44493.1875 | 6.77 |
| 44493.197916666664 | 6.71 |
| 44493.208333333336 | 6.7 |
| 44493.21875 | 6.65 |
| 44493.229166666664 | 6.47 |
| 44493.239583333336 | 6.53 |
| 44493.25 | 6.48 |
| 44493.260416666664 | 6.51 |
| 44493.270833333336 | 6.64 |
| 44493.28125 | 6.57 |
| 44493.291666666664 | 6.57 |
| 44493.302083333336 | 6.56 |
| 44493.3125 | 6.5 |
| 44493.322916666664 | 6.43 |
| 44493.333333333336 | 6.46 |
| 44493.34375 | 6.41 |
| 44493.354166666664 | 6.41 |
| 44493.364583333336 | 6.38 |
| 44493.375 | 6.39 |
| 44493.385416666664 | 6.39 |
| 44493.395833333336 | 6.37 |
| 44493.40625 | 6.37 |
| 44493.416666666664 | 6.14 |
| 44493.427083333336 | 6.11 |
| 44493.4375 | 6.15 |
| 44493.447916666664 | 6.18 |
| 44493.458333333336 | 6.2 |
| 44493.46875 | 6.26 |
| 44493.479166666664 | 6.29 |
| 44493.489583333336 | 6.34 |
| 44493.5 | 6.35 |
| 44493.510416666664 | 6.35 |
| 44493.520833333336 | 6.35 |
| 44493.53125 | 6.35 |
| 44493.541666666664 | 6.34 |
| 44493.552083333336 | 6.33 |
| 44493.5625 | 6.35 |
| 44493.572916666664 | 6.38 |
| 44493.583333333336 | 6.41 |
| 44493.59375 | 6.42 |
| 44493.604166666664 | 6.46 |
| 44493.614583333336 | 6.52 |
| 44493.625 | 6.51 |
| 44493.635416666664 | 6.61 |
| 44493.645833333336 | 6.62 |
| 44493.65625 | 6.66 |
| 44493.666666666664 | 6.69 |
| 44493.677083333336 | 6.71 |
| 44493.6875 | 6.74 |
| 44493.697916666664 | 6.82 |
| 44493.708333333336 | 7.04 |
| 44493.71875 | 7.18 |
| 44493.729166666664 | 7.29 |
| 44493.739583333336 | 7.37 |
| 44493.75 | 7.46 |
| 44493.760416666664 | 7.51 |
| 44493.770833333336 | 7.54 |
| 44493.78125 | 7.61 |
| 44493.791666666664 | 7.69 |
| 44493.802083333336 | 7.72 |
| 44493.8125 | 7.82 |
| 44493.822916666664 | 7.93 |
| 44493.833333333336 | 8 |
| 44493.84375 | 8.11 |
| 44493.854166666664 | 8.18 |
| 44493.864583333336 | 8.18 |
| 44493.875 | 8.17 |
| 44493.885416666664 | 8.11 |
| 44493.895833333336 | 8.1 |
| 44493.90625 | 8.06 |
| 44493.916666666664 | 8.02 |
| 44493.927083333336 | 8 |
| 44493.9375 | 7.78 |
| 44493.947916666664 | 7.58 |
| 44493.958333333336 | 7.57 |
| 44493.96875 | 7.59 |
| 44493.979166666664 | 7.57 |
| 44493.989583333336 | 7.49 |
| 44494.0 | 7.44 |
| 44494.010416666664 | 7.4 |
| 44494.020833333336 | 7.32 |
| 44494.03125 | 7.26 |
| 44494.041666666664 | 7.21 |
| 44494.052083333336 | 7.13 |
| 44494.0625 | 7.08 |
| 44494.072916666664 | 7.05 |
| 44494.083333333336 | 6.96 |
| 44494.09375 | 6.93 |
| 44494.104166666664 | 6.93 |
| 44494.114583333336 | 6.94 |
| 44494.125 | 6.96 |
| 44494.135416666664 | 6.91 |
| 44494.145833333336 | 6.86 |
| 44494.15625 | 6.87 |
| 44494.166666666664 | 6.8 |
| 44494.177083333336 | 6.81 |
| 44494.1875 | 6.91 |
| 44494.197916666664 | 6.83 |
| 44494.208333333336 | 6.79 |
| 44494.21875 | 6.75 |
| 44494.229166666664 | 6.72 |
| 44494.239583333336 | 6.65 |
| 44494.25 | 6.44 |
| 44494.260416666664 | 6.44 |
| 44494.270833333336 | 6.36 |
| 44494.28125 | 6.5 |
| 44494.291666666664 | 6.55 |
| 44494.302083333336 | 6.55 |
| 44494.3125 | 6.46 |
| 44494.322916666664 | 6.7 |
| 44494.333333333336 | 6.64 |
| 44494.34375 | 6.66 |
| 44494.354166666664 | 6.63 |
| 44494.364583333336 | 6.63 |
| 44494.375 | 6.55 |
| 44494.385416666664 | 6.59 |
| 44494.395833333336 | 6.59 |
| 44494.40625 | 6.51 |
| 44494.416666666664 | 6.56 |
| 44494.427083333336 | 6.54 |
| 44494.4375 | 6.28 |
| 44494.447916666664 | 6.19 |
| 44494.458333333336 | 6.18 |
| 44494.46875 | 6.28 |
| 44494.479166666664 | 6.31 |
| 44494.489583333336 | 6.29 |
| 44494.5 | 6.29 |
| 44494.510416666664 | 6.32 |
| 44494.520833333336 | 6.35 |
| 44494.53125 | 6.35 |
| 44494.541666666664 | 6.35 |
| 44494.552083333336 | 6.33 |
| 44494.5625 | 6.33 |
| 44494.572916666664 | 6.33 |
| 44494.583333333336 | 6.33 |
| 44494.59375 | 6.32 |
| 44494.604166666664 | 6.37 |
| 44494.614583333336 | 6.37 |
| 44494.625 | 6.37 |
| 44494.635416666664 | 6.4 |
| 44494.645833333336 | 6.46 |
| 44494.65625 | 6.49 |
| 44494.666666666664 | 6.5 |
| 44494.677083333336 | 6.6 |
| 44494.6875 | 6.63 |
| 44494.697916666664 | 6.59 |
| 44494.708333333336 | 6.64 |
| 44494.71875 | 6.73 |
| 44494.729166666664 | 6.96 |
| 44494.739583333336 | 7.06 |
| 44494.75 | 7.1 |
| 44494.760416666664 | 7.22 |
| 44494.770833333336 | 7.16 |
| 44494.78125 | 7.15 |
| 44494.791666666664 | 7.32 |
| 44494.802083333336 | 7.39 |
| 44494.8125 | 7.39 |
| 44494.822916666664 | 7.39 |
| 44494.833333333336 | 7.43 |
| 44494.84375 | 7.36 |
| 44494.854166666664 | 7.47 |
| 44494.864583333336 | 7.61 |
| 44494.875 | 7.51 |
| 44494.885416666664 | 7.55 |
| 44494.895833333336 | 7.51 |
| 44494.90625 | 7.63 |
| 44494.916666666664 | 7.61 |
| 44494.927083333336 | 7.64 |
| 44494.9375 | 7.64 |
| 44494.947916666664 | 7.61 |
| 44494.958333333336 | 7.59 |
| 44494.96875 | 7.52 |
| 44494.979166666664 | 6.87 |
| 44494.989583333336 | 6.22 |
| 44495.0 | 6.68 |
| 44495.010416666664 | 6.76 |
| 44495.020833333336 | 6.79 |
| 44495.03125 | 6.66 |
| 44495.041666666664 | 6.62 |
| 44495.052083333336 | 6.55 |
| 44495.0625 | 6.49 |
| 44495.072916666664 | 6.52 |
| 44495.083333333336 | 6.47 |
| 44495.09375 | 6.43 |
| 44495.104166666664 | 6.38 |
| 44495.114583333336 | 6.35 |
| 44495.125 | 6.31 |
| 44495.135416666664 | 6.28 |
| 44495.145833333336 | 6.27 |
| 44495.15625 | 6.21 |
| 44495.166666666664 | 6.17 |
| 44495.177083333336 | 6.21 |
| 44495.1875 | 6.15 |
| 44495.197916666664 | 6.1 |
| 44495.208333333336 | 6.07 |
| 44495.21875 | 6.19 |
| 44495.229166666664 | 6.37 |
| 44495.239583333336 | 6.33 |
| 44495.25 | 6.28 |
| 44495.260416666664 | 6.29 |
| 44495.270833333336 | 6.22 |
| 44495.28125 | 6.25 |
| 44495.291666666664 | 6.14 |
| 44495.302083333336 | 5.99 |
| 44495.3125 | 6.11 |
| 44495.322916666664 | 6.11 |
| 44495.333333333336 | 6.17 |
| 44495.34375 | 6.26 |
| 44495.354166666664 | 6.22 |
| 44495.364583333336 | 6.04 |
| 44495.375 | 6.11 |
| 44495.385416666664 | 6.14 |
| 44495.395833333336 | 6.28 |
| 44495.40625 | 6.1 |
| 44495.416666666664 | 6.3 |
| 44495.427083333336 | 6.02 |
| 44495.4375 | 6.01 |
| 44495.447916666664 | 5.95 |
| 44495.458333333336 | 5.95 |
| 44495.46875 | 6.16 |
| 44495.479166666664 | 6.3 |
| 44495.489583333336 | 6.09 |
| 44495.5 | 5.83 |
| 44495.510416666664 | 5.84 |
| 44495.520833333336 | 5.77 |
| 44495.53125 | 5.99 |
| 44495.541666666664 | 6.02 |
| 44495.552083333336 | 6.1 |
| 44495.5625 | 6.16 |
| 44495.572916666664 | 6.21 |
| 44495.583333333336 | 6.26 |
| 44495.59375 | 6.29 |
| 44495.604166666664 | 6.33 |
| 44495.614583333336 | 6.39 |
| 44495.625 | 6.44 |
| 44495.635416666664 | 6.46 |
| 44495.645833333336 | 6.49 |
| 44495.65625 | 6.57 |
| 44495.666666666664 | 6.62 |
| 44495.677083333336 | 6.69 |
| 44495.6875 | 6.75 |
| 44495.697916666664 | 6.8 |
| 44495.708333333336 | 6.82 |
| 44495.71875 | 6.78 |
| 44495.729166666664 | 6.63 |
| 44495.739583333336 | 6.87 |
| 44495.75 | 7 |
| 44495.760416666664 | 7.05 |
| 44495.770833333336 | 7.15 |
| 44495.78125 | 7.23 |
| 44495.791666666664 | 7.36 |
| 44495.802083333336 | 7.39 |
| 44495.8125 | 7.36 |
| 44495.822916666664 | 7.35 |
| 44495.833333333336 | 7.33 |
| 44495.84375 | 7.44 |
| 44495.854166666664 | 7.39 |
| 44495.864583333336 | 7.34 |
| 44495.875 | 7.32 |
| 44495.885416666664 | 7.34 |
| 44495.895833333336 | 7.34 |
| 44495.90625 | 7.41 |
| 44495.916666666664 | 7.47 |
| 44495.927083333336 | 7.53 |
| 44495.9375 | 7.59 |
| 44495.947916666664 | 7.67 |
| 44495.958333333336 | 7.65 |
| 44495.96875 | 7.62 |
| 44495.979166666664 | 7.58 |
| 44495.989583333336 | 7.46 |
| 44496.0 | 7.06 |
| 44496.010416666664 | 6.75 |
| 44496.020833333336 | 7.08 |
| 44496.03125 | 6.75 |
| 44496.041666666664 | 6.47 |
| 44496.052083333336 | 6.33 |
| 44496.0625 | 6.55 |
| 44496.072916666664 | 6.72 |
| 44496.083333333336 | 6.52 |
| 44496.09375 | 6.65 |
| 44496.104166666664 | 6.73 |
| 44496.114583333336 | 6.79 |
| 44496.125 | 6.83 |
| 44496.135416666664 | 6.87 |
| 44496.145833333336 | 6.84 |
| 44496.15625 | 6.87 |
| 44496.166666666664 | 6.83 |
| 44496.177083333336 | 6.86 |
| 44496.1875 | 6.86 |
| 44496.197916666664 | 6.87 |
| 44496.208333333336 | 6.85 |
| 44496.21875 | 6.82 |
| 44496.229166666664 | 6.74 |
| 44496.239583333336 | 6.92 |
| 44496.25 | 7.03 |
| 44496.260416666664 | 7.05 |
| 44496.270833333336 | 6.92 |
| 44496.28125 | 6.85 |
| 44496.291666666664 | 6.95 |
| 44496.302083333336 | 6.84 |
| 44496.3125 | 6.91 |
| 44496.322916666664 | 6.83 |
| 44496.333333333336 | 6.89 |
| 44496.34375 | 6.81 |
| 44496.354166666664 | 6.76 |
| 44496.364583333336 | 6.78 |
| 44496.375 | 6.85 |
| 44496.385416666664 | 6.85 |
| 44496.395833333336 | 6.77 |
| 44496.40625 | 6.71 |
| 44496.416666666664 | 6.84 |
| 44496.427083333336 | 7.01 |
| 44496.4375 | 7.03 |
| 44496.447916666664 | 7.03 |
| 44496.458333333336 | 6.97 |
| 44496.46875 | 6.81 |
| 44496.479166666664 | 6.55 |
| 44496.489583333336 | 6.65 |
| 44496.5 | 6.74 |
| 44496.510416666664 | 6.8 |
| 44496.520833333336 | 6.8 |
| 44496.53125 | 6.86 |
| 44496.541666666664 | 6.91 |
| 44496.552083333336 | 6.91 |
| 44496.5625 | 6.93 |
| 44496.572916666664 | 6.95 |
| 44496.583333333336 | 6.98 |
| 44496.59375 | 7.01 |
| 44496.604166666664 | 7.03 |
| 44496.614583333336 | 7.05 |
| 44496.625 | 7.08 |
| 44496.635416666664 | 7.1 |
| 44496.645833333336 | 7.14 |
| 44496.65625 | 7.18 |
| 44496.666666666664 | 7.23 |
| 44496.677083333336 | 7.26 |
| 44496.6875 | 7.31 |
| 44496.697916666664 | 7.35 |
| 44496.708333333336 | 7.37 |
| 44496.71875 | 7.42 |
| 44496.729166666664 | 7.45 |
| 44496.739583333336 | 7.46 |
| 44496.75 | 7.49 |
| 44496.760416666664 | 7.48 |
| 44496.770833333336 | 7.45 |
| 44496.78125 | 7.44 |
| 44496.791666666664 | 7.54 |
| 44496.802083333336 | 7.48 |
| 44496.8125 | 7.52 |
| 44496.822916666664 | 7.52 |
| 44496.833333333336 | 7.58 |
| 44496.84375 | 7.58 |
| 44496.854166666664 | 7.6 |
| 44496.864583333336 | 7.57 |
| 44496.875 | 7.64 |
| 44496.885416666664 | 7.57 |
| 44496.895833333336 | 7.58 |
| 44496.90625 | 7.58 |
| 44496.916666666664 | 7.57 |
| 44496.927083333336 | 7.54 |
| 44496.9375 | 7.57 |
| 44496.947916666664 | 7.5 |
| 44496.958333333336 | 7.47 |
| 44496.96875 | 7.49 |
| 44496.979166666664 | 7.46 |
| 44496.989583333336 | 7.37 |
| 44497.0 | 7.34 |
| 44497.010416666664 | 7.29 |
| 44497.020833333336 | 7.44 |
| 44497.03125 | 7.36 |
| 44497.041666666664 | 7.36 |
| 44497.052083333336 | 7.3 |
| 44497.0625 | 7.18 |
| 44497.072916666664 | 6.97 |
| 44497.083333333336 | 7.14 |
| 44497.09375 | 7.13 |
| 44497.104166666664 | 7.14 |
| 44497.114583333336 | 7.18 |
| 44497.125 | 7.19 |
| 44497.135416666664 | 7.19 |
| 44497.145833333336 | 7.16 |
| 44497.15625 | 7.13 |
| 44497.166666666664 | 7.09 |
| 44497.177083333336 | 7.05 |
| 44497.1875 | 7.03 |
| 44497.197916666664 | 7.02 |
| 44497.208333333336 | 7.01 |
| 44497.21875 | 6.99 |
| 44497.229166666664 | 6.97 |
| 44497.239583333336 | 6.96 |
| 44497.25 | 6.74 |
| 44497.260416666664 | 6.82 |
| 44497.270833333336 | 6.64 |
| 44497.28125 | 6.72 |
| 44497.291666666664 | 6.57 |
| 44497.302083333336 | 6.54 |
| 44497.3125 | 6.46 |
| 44497.322916666664 | 6.34 |
| 44497.333333333336 | 6.32 |
| 44497.34375 | 6.51 |
| 44497.354166666664 | 6.25 |
| 44497.364583333336 | 6.3 |
| 44497.375 | 6.32 |
| 44497.385416666664 | 6.49 |
| 44497.395833333336 | 6.4 |
| 44497.40625 | 6.26 |
| 44497.416666666664 | 6.31 |
| 44497.427083333336 | 6.17 |
| 44497.4375 | 6.18 |
| 44497.447916666664 | 6.07 |
| 44497.458333333336 | 5.99 |
| 44497.46875 | 6.04 |
| 44497.479166666664 | 5.94 |
| 44497.489583333336 | 6.18 |
| 44497.5 | 6.12 |
| 44497.510416666664 | 6.12 |
| 44497.520833333336 | 6.38 |
| 44497.53125 | 6.16 |
| 44497.541666666664 | 6.07 |
| 44497.552083333336 | 6.19 |
| 44497.5625 | 6.17 |
| 44497.572916666664 | 6.26 |
| 44497.583333333336 | 6.3 |
| 44497.59375 | 6.35 |
| 44497.604166666664 | 6.37 |
| 44497.614583333336 | 6.38 |
| 44497.625 | 6.41 |
| 44497.635416666664 | 6.49 |
| 44497.645833333336 | 6.56 |
| 44497.65625 | 6.65 |
| 44497.666666666664 | 6.69 |
| 44497.677083333336 | 6.72 |
| 44497.6875 | 6.76 |
| 44497.697916666664 | 6.79 |
| 44497.708333333336 | 6.82 |
| 44497.71875 | 6.83 |
| 44497.729166666664 | 6.87 |
| 44497.739583333336 | 6.9 |
| 44497.75 | 6.95 |
| 44497.760416666664 | 6.97 |
| 44497.770833333336 | 6.96 |
| 44497.78125 | 6.99 |
| 44497.791666666664 | 6.77 |
| 44497.802083333336 | 6.95 |
| 44497.8125 | 6.96 |
| 44497.822916666664 | 7.18 |
| 44497.833333333336 | 7.2 |
| 44497.84375 | 7.23 |
| 44497.854166666664 | 7.39 |
| 44497.864583333336 | 7.35 |
| 44497.875 | 7.4 |
| 44497.885416666664 | 7.34 |
| 44497.895833333336 | 7.37 |
| 44497.90625 | 7.33 |
| 44497.916666666664 | 7.27 |
| 44497.927083333336 | 7.28 |
| 44497.9375 | 7.23 |
| 44497.947916666664 | 7.1 |
| 44497.958333333336 | 7.07 |
| 44497.96875 | 7.08 |
| 44497.979166666664 | 7.04 |
| 44497.989583333336 | 7.04 |
| 44498.0 | 7.06 |
| 44498.010416666664 | 7.03 |
| 44498.020833333336 | 7.04 |
| 44498.03125 | 7.08 |
| 44498.041666666664 | 6.94 |
| 44498.052083333336 | 7.22 |
| 44498.0625 | 7.3 |
| 44498.072916666664 | 7.19 |
| 44498.083333333336 | 7.33 |
| 44498.09375 | 7.37 |
| 44498.104166666664 | 7.35 |
| 44498.114583333336 | 7.38 |
| 44498.125 | 6.8 |
| 44498.135416666664 | 7.09 |
| 44498.145833333336 | 7.1 |
| 44498.15625 | 7.11 |
| 44498.166666666664 | 7.12 |
| 44498.177083333336 | 7.14 |
| 44498.1875 | 7.14 |
| 44498.197916666664 | 7.09 |
| 44498.208333333336 | 7.18 |
| 44498.21875 | 7.15 |
| 44498.229166666664 | 7.16 |
| 44498.239583333336 | 7.15 |
| 44498.25 | 7.15 |
| 44498.260416666664 | 7.19 |
| 44498.270833333336 | 7.16 |
| 44498.28125 | 6.74 |
| 44498.291666666664 | 5.99 |
| 44498.302083333336 | 6.51 |
| 44498.3125 | 6.6 |
| 44498.322916666664 | 6.6 |
| 44498.333333333336 | 6.89 |
| 44498.34375 | 6.66 |
| 44498.354166666664 | 6.86 |
| 44498.364583333336 | 6.72 |
| 44498.375 | 6.87 |
| 44498.385416666664 | 7.06 |
| 44498.395833333336 | 7.12 |
| 44498.40625 | 7 |
| 44498.416666666664 | 6.86 |
| 44498.427083333336 | 7.11 |
| 44498.4375 | 7.06 |
| 44498.447916666664 | 7.11 |
| 44498.458333333336 | 7.15 |
| 44498.46875 | 7.1 |
| 44498.479166666664 | 7.12 |
| 44498.489583333336 | 7.05 |
| 44498.5 | 7.06 |
| 44498.510416666664 | 7.14 |
| 44498.520833333336 | 7.09 |
| 44498.53125 | 7.17 |
| 44498.541666666664 | 7.23 |
| 44498.552083333336 | 7.26 |
| 44498.5625 | 7.27 |
| 44498.572916666664 | 7.26 |
| 44498.583333333336 | 7.28 |
| 44498.59375 | 7.3 |
| 44498.604166666664 | 7.24 |
| 44498.614583333336 | 7.26 |
| 44498.625 | 7.25 |
| 44498.635416666664 | 7.21 |
| 44498.645833333336 | 7.25 |
| 44498.65625 | 7.26 |
| 44498.666666666664 | 7.32 |
| 44498.677083333336 | 7.38 |
| 44498.6875 | 7.38 |
| 44498.697916666664 | 7.4 |
| 44498.708333333336 | 7.42 |
| 44498.71875 | 7.42 |
| 44498.729166666664 | 7.42 |
| 44498.739583333336 | 7.42 |
| 44498.75 | 7.42 |
| 44498.760416666664 | 7.41 |
| 44498.770833333336 | 7.4 |
| 44498.78125 | 7.41 |
| 44498.791666666664 | 7.49 |
| 44498.802083333336 | 7.48 |
| 44498.8125 | 7.48 |
| 44498.822916666664 | 7.44 |
| 44498.833333333336 | 7.41 |
| 44498.84375 | 7.44 |
| 44498.854166666664 | 7.43 |
| 44498.864583333336 | 7.39 |
| 44498.875 | 7.34 |
| 44498.885416666664 | 7.27 |
| 44498.895833333336 | 7.36 |
| 44498.90625 | 7.38 |
| 44498.916666666664 | 7.38 |
| 44498.927083333336 | 7.36 |
| 44498.9375 | 7.32 |
| 44498.947916666664 | 7.32 |
| 44498.958333333336 | 7.28 |
| 44498.96875 | 7.25 |
| 44498.979166666664 | 7.22 |
| 44498.989583333336 | 7.16 |
| 44499.0 | 7.18 |
| 44499.010416666664 | 7.15 |
| 44499.020833333336 | 7.09 |
| 44499.03125 | 7 |
| 44499.041666666664 | 6.9 |
| 44499.052083333336 | 6.88 |
| 44499.0625 | 6.94 |
| 44499.072916666664 | 6.84 |
| 44499.083333333336 | 6.85 |
| 44499.09375 | 6.82 |
| 44499.104166666664 | 6.87 |
| 44499.114583333336 | 6.9 |
| 44499.125 | 6.9 |
| 44499.135416666664 | 6.78 |
| 44499.145833333336 | 6.3 |
| 44499.15625 | 6.53 |
| 44499.166666666664 | 6.64 |
| 44499.177083333336 | 6.65 |
| 44499.1875 | 6.71 |
| 44499.197916666664 | 6.71 |
| 44499.208333333336 | 6.78 |
| 44499.21875 | 6.84 |
| 44499.229166666664 | 6.82 |
| 44499.239583333336 | 6.8 |
| 44499.25 | 6.8 |
| 44499.260416666664 | 6.74 |
| 44499.270833333336 | 6.76 |
| 44499.28125 | 6.85 |
| 44499.291666666664 | 6.82 |
| 44499.302083333336 | 6.79 |
| 44499.3125 | 6.7 |
| 44499.322916666664 | 6.88 |
| 44499.333333333336 | 6.8 |
| 44499.34375 | 6.91 |
| 44499.354166666664 | 6.85 |
| 44499.364583333336 | 6.88 |
| 44499.375 | 6.85 |
| 44499.385416666664 | 6.77 |
| 44499.395833333336 | 6.69 |
| 44499.40625 | 6.73 |
| 44499.416666666664 | 6.85 |
| 44499.427083333336 | 6.88 |
| 44499.4375 | 6.87 |
| 44499.447916666664 | 6.82 |
| 44499.458333333336 | 6.48 |
| 44499.46875 | 6.39 |
| 44499.479166666664 | 6.33 |
| 44499.489583333336 | 6.32 |
| 44499.5 | 6.14 |
| 44499.510416666664 | 6.03 |
| 44499.520833333336 | 6.03 |
| 44499.53125 | 5.97 |
| 44499.541666666664 | 6.07 |
| 44499.552083333336 | 6.34 |
| 44499.5625 | 6.5 |
| 44499.572916666664 | 6.55 |
| 44499.583333333336 | 6.56 |
| 44499.59375 | 6.57 |
| 44499.604166666664 | 6.57 |
| 44499.614583333336 | 6.41 |
| 44499.625 | 6.38 |
| 44499.635416666664 | 6.43 |
| 44499.645833333336 | 6.44 |
| 44499.65625 | 6.56 |
| 44499.666666666664 | 6.6 |
| 44499.677083333336 | 6.79 |
| 44499.6875 | 6.93 |
| 44499.697916666664 | 7.04 |
| 44499.708333333336 | 7.16 |
| 44499.71875 | 7.21 |
| 44499.729166666664 | 7.22 |
| 44499.739583333336 | 7.2 |
| 44499.75 | 7.22 |
| 44499.760416666664 | 7.26 |
| 44499.770833333336 | 7.32 |
| 44499.78125 | 7.39 |
| 44499.791666666664 | 7.49 |
| 44499.802083333336 | 7.56 |
| 44499.8125 | 7.62 |
| 44499.822916666664 | 7.65 |
| 44499.833333333336 | 7.67 |
| 44499.84375 | 7.71 |
| 44499.854166666664 | 7.63 |
| 44499.864583333336 | 7.56 |
| 44499.875 | 7.58 |
| 44499.885416666664 | 7.52 |
| 44499.895833333336 | 7.61 |
| 44499.90625 | 7.6 |
| 44499.916666666664 | 7.6 |
| 44499.927083333336 | 7.6 |
| 44499.9375 | 7.59 |
| 44499.947916666664 | 7.63 |
| 44499.958333333336 | 7.56 |
| 44499.96875 | 7.52 |
| 44499.979166666664 | 7.54 |
| 44499.989583333336 | 7.52 |
| 44500.0 | 7.38 |
| 44500.010416666664 | 7.43 |
| 44500.020833333336 | 7.35 |
| 44500.03125 | 7.29 |
| 44500.041666666664 | 7.18 |
| 44500.052083333336 | 7.19 |
| 44500.0625 | 6.99 |
| 44500.072916666664 | 6.95 |
| 44500.083333333336 | 6.94 |
| 44500.09375 | 6.97 |
| 44500.104166666664 | 6.98 |
| 44500.114583333336 | 7.16 |
| 44500.125 | 7.26 |
| 44500.135416666664 | 7.22 |
| 44500.145833333336 | 7.2 |
| 44500.15625 | 7.15 |
| 44500.166666666664 | 7.05 |
| 44500.177083333336 | 7.06 |
| 44500.1875 | 7.05 |
| 44500.197916666664 | 7.03 |
| 44500.208333333336 | 7.06 |
| 44500.21875 | 7.07 |
| 44500.229166666664 | 7.09 |
| 44500.239583333336 | 7.04 |
| 44500.25 | 7 |
| 44500.260416666664 | 7 |
| 44500.270833333336 | 7.02 |
| 44500.28125 | 7.02 |
| 44500.291666666664 | 7.03 |
| 44500.302083333336 | 7.03 |
| 44500.3125 | 7.02 |
| 44500.322916666664 | 7.01 |
| 44500.333333333336 | 7.02 |
| 44500.34375 | 7 |
| 44500.354166666664 | 6.97 |
| 44500.364583333336 | 6.98 |
| 44500.375 | 6.96 |
| 44500.385416666664 | 6.95 |
| 44500.395833333336 | 6.92 |
| 44500.40625 | 6.86 |
| 44500.416666666664 | 6.95 |
| 44500.427083333336 | 6.91 |
| 44500.4375 | 6.78 |
| 44500.447916666664 | 6.77 |
| 44500.458333333336 | 6.73 |
| 44500.46875 | 6.68 |
| 44500.479166666664 | 6.58 |
| 44500.489583333336 | 6.52 |
| 44500.5 | 6.36 |
| 44500.510416666664 | 6.25 |
| 44500.520833333336 | 6.23 |
| 44500.53125 | 6.16 |
| 44500.541666666664 | 6.15 |
| 44500.552083333336 | 6.15 |
| 44500.5625 | 6.18 |
| 44500.572916666664 | 6.25 |
| 44500.583333333336 | 6.43 |
| 44500.59375 | 6.48 |
| 44500.604166666664 | 6.54 |
| 44500.614583333336 | 6.68 |
| 44500.625 | 6.61 |
| 44500.635416666664 | 6.66 |
| 44500.645833333336 | 6.65 |
| 44500.65625 | 6.69 |
| 44500.666666666664 | 6.6 |
| 44500.677083333336 | 6.61 |
| 44500.6875 | 6.6 |
| 44500.697916666664 | 6.56 |
| 44500.708333333336 | 6.69 |
| 44500.71875 | 6.81 |
| 44500.729166666664 | 6.94 |
| 44500.739583333336 | 7.21 |
| 44500.75 | 7.55 |
| 44500.760416666664 | 7.67 |
| 44500.770833333336 | 7.71 |
| 44500.78125 | 7.74 |
| 44500.791666666664 | 7.78 |
| 44500.802083333336 | 7.81 |
| 44500.8125 | 7.84 |
| 44500.822916666664 | 7.85 |
| 44500.833333333336 | 7.86 |
| 44500.84375 | 7.9 |
| 44500.854166666664 | 7.93 |
| 44500.864583333336 | 7.96 |
| 44500.875 | 7.96 |
| 44500.885416666664 | 7.98 |
| 44500.895833333336 | 7.99 |
| 44500.90625 | 7.98 |
| 44500.916666666664 | 7.91 |
| 44500.927083333336 | 7.75 |
| 44500.9375 | 7.74 |
| 44500.947916666664 | 7.81 |
| 44500.958333333336 | 7.79 |
| 44500.96875 | 7.79 |
| 44500.979166666664 | 7.86 |
| 44500.989583333336 | 7.87 |
| 44501.0 | 7.91 |
| 44501.010416666664 | 7.71 |
| 44501.020833333336 | 7.63 |
| 44501.03125 | 7.56 |
| 44501.041666666664 | 7.38 |
| 44501.052083333336 | 7.19 |
| 44501.0625 | 7.11 |
| 44501.072916666664 | 6.99 |
| 44501.083333333336 | 6.96 |
| 44501.09375 | 6.98 |
| 44501.104166666664 | 7.05 |
| 44501.114583333336 | 7.17 |
| 44501.125 | 7.17 |
| 44501.135416666664 | 7.21 |
| 44501.145833333336 | 7.14 |
| 44501.15625 | 7.1 |